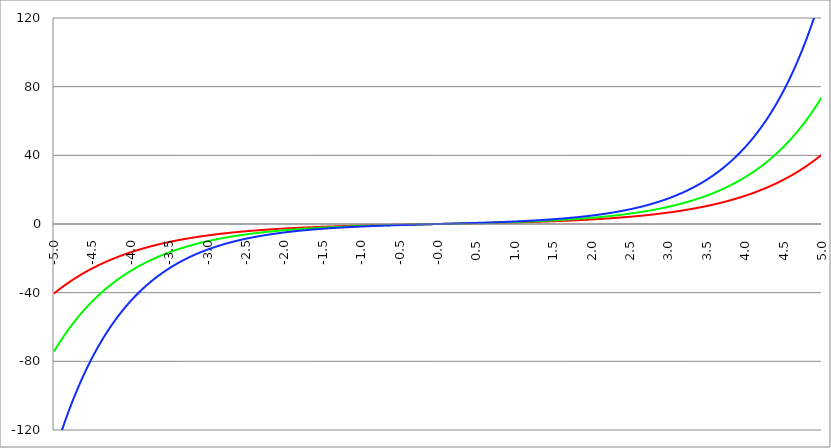
| Category | Series 1 | Series 0 | Series 2 |
|---|---|---|---|
| -5.0 | -40.503 | -74.203 | -134.578 |
| -4.995 | -40.321 | -73.833 | -133.84 |
| -4.99 | -40.14 | -73.465 | -133.106 |
| -4.985 | -39.959 | -73.098 | -132.376 |
| -4.98 | -39.78 | -72.734 | -131.65 |
| -4.975 | -39.601 | -72.371 | -130.928 |
| -4.97 | -39.423 | -72.01 | -130.21 |
| -4.965000000000001 | -39.246 | -71.651 | -129.495 |
| -4.960000000000001 | -39.07 | -71.293 | -128.785 |
| -4.955000000000001 | -38.895 | -70.938 | -128.079 |
| -4.950000000000001 | -38.72 | -70.584 | -127.376 |
| -4.945000000000001 | -38.546 | -70.232 | -126.677 |
| -4.940000000000001 | -38.373 | -69.882 | -125.983 |
| -4.935000000000001 | -38.201 | -69.533 | -125.292 |
| -4.930000000000001 | -38.029 | -69.186 | -124.604 |
| -4.925000000000002 | -37.858 | -68.841 | -123.921 |
| -4.920000000000002 | -37.688 | -68.498 | -123.241 |
| -4.915000000000002 | -37.519 | -68.156 | -122.565 |
| -4.910000000000002 | -37.351 | -67.816 | -121.893 |
| -4.905000000000002 | -37.183 | -67.478 | -121.224 |
| -4.900000000000002 | -37.016 | -67.141 | -120.559 |
| -4.895000000000002 | -36.85 | -66.806 | -119.898 |
| -4.890000000000002 | -36.684 | -66.473 | -119.24 |
| -4.885000000000002 | -36.519 | -66.141 | -118.586 |
| -4.880000000000002 | -36.355 | -65.812 | -117.936 |
| -4.875000000000003 | -36.192 | -65.483 | -117.289 |
| -4.870000000000003 | -36.029 | -65.157 | -116.646 |
| -4.865000000000003 | -35.868 | -64.832 | -116.006 |
| -4.860000000000003 | -35.707 | -64.508 | -115.37 |
| -4.855000000000003 | -35.546 | -64.186 | -114.737 |
| -4.850000000000003 | -35.387 | -63.866 | -114.107 |
| -4.845000000000003 | -35.228 | -63.548 | -113.481 |
| -4.840000000000003 | -35.069 | -63.231 | -112.859 |
| -4.835000000000003 | -34.912 | -62.915 | -112.24 |
| -4.830000000000004 | -34.755 | -62.601 | -111.624 |
| -4.825000000000004 | -34.599 | -62.289 | -111.012 |
| -4.820000000000004 | -34.444 | -61.979 | -110.403 |
| -4.815000000000004 | -34.289 | -61.669 | -109.798 |
| -4.810000000000004 | -34.135 | -61.362 | -109.195 |
| -4.805000000000004 | -33.982 | -61.056 | -108.596 |
| -4.800000000000004 | -33.829 | -60.751 | -108.001 |
| -4.795000000000004 | -33.677 | -60.448 | -107.408 |
| -4.790000000000004 | -33.526 | -60.147 | -106.819 |
| -4.785000000000004 | -33.375 | -59.847 | -106.233 |
| -4.780000000000004 | -33.225 | -59.548 | -105.65 |
| -4.775000000000004 | -33.076 | -59.251 | -105.071 |
| -4.770000000000004 | -32.927 | -58.955 | -104.495 |
| -4.765000000000005 | -32.78 | -58.661 | -103.921 |
| -4.760000000000005 | -32.632 | -58.369 | -103.351 |
| -4.755000000000005 | -32.486 | -58.078 | -102.784 |
| -4.750000000000005 | -32.34 | -57.788 | -102.221 |
| -4.745000000000005 | -32.195 | -57.5 | -101.66 |
| -4.740000000000005 | -32.05 | -57.213 | -101.102 |
| -4.735000000000005 | -31.906 | -56.927 | -100.548 |
| -4.730000000000005 | -31.763 | -56.643 | -99.996 |
| -4.725000000000006 | -31.62 | -56.361 | -99.448 |
| -4.720000000000006 | -31.478 | -56.08 | -98.902 |
| -4.715000000000006 | -31.337 | -55.8 | -98.36 |
| -4.710000000000006 | -31.196 | -55.522 | -97.82 |
| -4.705000000000006 | -31.056 | -55.245 | -97.284 |
| -4.700000000000006 | -30.916 | -54.969 | -96.75 |
| -4.695000000000006 | -30.777 | -54.695 | -96.219 |
| -4.690000000000006 | -30.639 | -54.422 | -95.692 |
| -4.685000000000007 | -30.501 | -54.151 | -95.167 |
| -4.680000000000007 | -30.364 | -53.88 | -94.645 |
| -4.675000000000007 | -30.228 | -53.612 | -94.125 |
| -4.670000000000007 | -30.092 | -53.344 | -93.609 |
| -4.665000000000007 | -29.957 | -53.078 | -93.096 |
| -4.660000000000007 | -29.823 | -52.813 | -92.585 |
| -4.655000000000007 | -29.689 | -52.55 | -92.077 |
| -4.650000000000007 | -29.555 | -52.288 | -91.572 |
| -4.645000000000007 | -29.422 | -52.027 | -91.07 |
| -4.640000000000008 | -29.29 | -51.767 | -90.57 |
| -4.635000000000008 | -29.159 | -51.509 | -90.073 |
| -4.630000000000008 | -29.028 | -51.252 | -89.579 |
| -4.625000000000008 | -28.897 | -50.996 | -89.088 |
| -4.620000000000008 | -28.768 | -50.742 | -88.599 |
| -4.615000000000008 | -28.638 | -50.489 | -88.113 |
| -4.610000000000008 | -28.51 | -50.237 | -87.63 |
| -4.605000000000008 | -28.382 | -49.986 | -87.149 |
| -4.600000000000008 | -28.254 | -49.737 | -86.671 |
| -4.595000000000009 | -28.127 | -49.489 | -86.196 |
| -4.590000000000009 | -28.001 | -49.242 | -85.723 |
| -4.585000000000009 | -27.875 | -48.996 | -85.253 |
| -4.580000000000009 | -27.75 | -48.752 | -84.785 |
| -4.57500000000001 | -27.625 | -48.509 | -84.32 |
| -4.57000000000001 | -27.501 | -48.267 | -83.858 |
| -4.565000000000009 | -27.378 | -48.026 | -83.398 |
| -4.560000000000009 | -27.255 | -47.787 | -82.94 |
| -4.555000000000009 | -27.132 | -47.548 | -82.485 |
| -4.55000000000001 | -27.01 | -47.311 | -82.033 |
| -4.54500000000001 | -26.889 | -47.075 | -81.583 |
| -4.54000000000001 | -26.768 | -46.84 | -81.135 |
| -4.53500000000001 | -26.648 | -46.606 | -80.69 |
| -4.53000000000001 | -26.528 | -46.374 | -80.248 |
| -4.52500000000001 | -26.409 | -46.143 | -79.807 |
| -4.52000000000001 | -26.29 | -45.912 | -79.37 |
| -4.51500000000001 | -26.172 | -45.683 | -78.934 |
| -4.51000000000001 | -26.055 | -45.455 | -78.501 |
| -4.505000000000011 | -25.938 | -45.229 | -78.071 |
| -4.500000000000011 | -25.821 | -45.003 | -77.642 |
| -4.495000000000011 | -25.705 | -44.779 | -77.216 |
| -4.490000000000011 | -25.59 | -44.555 | -76.793 |
| -4.485000000000011 | -25.475 | -44.333 | -76.372 |
| -4.480000000000011 | -25.36 | -44.112 | -75.953 |
| -4.475000000000011 | -25.246 | -43.892 | -75.536 |
| -4.470000000000011 | -25.133 | -43.673 | -75.122 |
| -4.465000000000011 | -25.02 | -43.455 | -74.71 |
| -4.460000000000011 | -24.907 | -43.238 | -74.3 |
| -4.455000000000012 | -24.796 | -43.022 | -73.892 |
| -4.450000000000012 | -24.684 | -42.808 | -73.487 |
| -4.445000000000012 | -24.573 | -42.594 | -73.084 |
| -4.440000000000012 | -24.463 | -42.382 | -72.683 |
| -4.435000000000012 | -24.353 | -42.17 | -72.284 |
| -4.430000000000012 | -24.243 | -41.96 | -71.888 |
| -4.425000000000012 | -24.135 | -41.75 | -71.493 |
| -4.420000000000012 | -24.026 | -41.542 | -71.101 |
| -4.415000000000012 | -23.918 | -41.335 | -70.711 |
| -4.410000000000013 | -23.811 | -41.129 | -70.323 |
| -4.405000000000013 | -23.704 | -40.923 | -69.937 |
| -4.400000000000013 | -23.597 | -40.719 | -69.554 |
| -4.395000000000013 | -23.491 | -40.516 | -69.172 |
| -4.390000000000013 | -23.386 | -40.314 | -68.793 |
| -4.385000000000013 | -23.281 | -40.113 | -68.415 |
| -4.380000000000013 | -23.176 | -39.913 | -68.04 |
| -4.375000000000013 | -23.072 | -39.714 | -67.667 |
| -4.370000000000013 | -22.968 | -39.515 | -67.296 |
| -4.365000000000013 | -22.865 | -39.318 | -66.927 |
| -4.360000000000014 | -22.762 | -39.122 | -66.559 |
| -4.355000000000014 | -22.66 | -38.927 | -66.194 |
| -4.350000000000014 | -22.558 | -38.733 | -65.831 |
| -4.345000000000014 | -22.457 | -38.54 | -65.47 |
| -4.340000000000014 | -22.356 | -38.347 | -65.111 |
| -4.335000000000014 | -22.255 | -38.156 | -64.754 |
| -4.330000000000014 | -22.155 | -37.966 | -64.398 |
| -4.325000000000014 | -22.056 | -37.776 | -64.045 |
| -4.320000000000014 | -21.957 | -37.588 | -63.694 |
| -4.315000000000015 | -21.858 | -37.4 | -63.344 |
| -4.310000000000015 | -21.76 | -37.214 | -62.997 |
| -4.305000000000015 | -21.662 | -37.028 | -62.651 |
| -4.300000000000015 | -21.565 | -36.843 | -62.308 |
| -4.295000000000015 | -21.468 | -36.659 | -61.966 |
| -4.290000000000015 | -21.371 | -36.476 | -61.626 |
| -4.285000000000015 | -21.275 | -36.294 | -61.288 |
| -4.280000000000015 | -21.18 | -36.113 | -60.952 |
| -4.275000000000015 | -21.084 | -35.933 | -60.617 |
| -4.270000000000015 | -20.99 | -35.754 | -60.285 |
| -4.265000000000016 | -20.895 | -35.575 | -59.954 |
| -4.260000000000016 | -20.801 | -35.398 | -59.625 |
| -4.255000000000016 | -20.708 | -35.221 | -59.298 |
| -4.250000000000016 | -20.615 | -35.046 | -58.973 |
| -4.245000000000016 | -20.522 | -34.871 | -58.649 |
| -4.240000000000016 | -20.43 | -34.697 | -58.328 |
| -4.235000000000016 | -20.338 | -34.524 | -58.008 |
| -4.230000000000016 | -20.247 | -34.351 | -57.689 |
| -4.225000000000017 | -20.156 | -34.18 | -57.373 |
| -4.220000000000017 | -20.065 | -34.009 | -57.058 |
| -4.215000000000017 | -19.975 | -33.84 | -56.745 |
| -4.210000000000017 | -19.885 | -33.671 | -56.434 |
| -4.205000000000017 | -19.796 | -33.503 | -56.124 |
| -4.200000000000017 | -19.707 | -33.336 | -55.816 |
| -4.195000000000017 | -19.618 | -33.169 | -55.51 |
| -4.190000000000017 | -19.53 | -33.004 | -55.206 |
| -4.185000000000017 | -19.442 | -32.839 | -54.903 |
| -4.180000000000017 | -19.355 | -32.675 | -54.602 |
| -4.175000000000018 | -19.268 | -32.512 | -54.302 |
| -4.170000000000018 | -19.181 | -32.35 | -54.004 |
| -4.165000000000018 | -19.095 | -32.189 | -53.708 |
| -4.160000000000018 | -19.009 | -32.028 | -53.413 |
| -4.155000000000018 | -18.924 | -31.868 | -53.12 |
| -4.150000000000018 | -18.839 | -31.709 | -52.829 |
| -4.145000000000018 | -18.754 | -31.551 | -52.539 |
| -4.140000000000018 | -18.67 | -31.393 | -52.251 |
| -4.135000000000018 | -18.586 | -31.237 | -51.964 |
| -4.130000000000019 | -18.502 | -31.081 | -51.679 |
| -4.125000000000019 | -18.419 | -30.926 | -51.395 |
| -4.120000000000019 | -18.336 | -30.771 | -51.113 |
| -4.115000000000019 | -18.254 | -30.618 | -50.833 |
| -4.110000000000019 | -18.172 | -30.465 | -50.554 |
| -4.105000000000019 | -18.09 | -30.313 | -50.277 |
| -4.100000000000019 | -18.009 | -30.162 | -50.001 |
| -4.095000000000019 | -17.928 | -30.011 | -49.727 |
| -4.090000000000019 | -17.847 | -29.862 | -49.454 |
| -4.085000000000019 | -17.767 | -29.713 | -49.183 |
| -4.08000000000002 | -17.687 | -29.564 | -48.913 |
| -4.07500000000002 | -17.608 | -29.417 | -48.644 |
| -4.07000000000002 | -17.529 | -29.27 | -48.377 |
| -4.06500000000002 | -17.45 | -29.124 | -48.112 |
| -4.06000000000002 | -17.371 | -28.979 | -47.848 |
| -4.05500000000002 | -17.293 | -28.834 | -47.586 |
| -4.05000000000002 | -17.215 | -28.69 | -47.324 |
| -4.04500000000002 | -17.138 | -28.547 | -47.065 |
| -4.04000000000002 | -17.061 | -28.404 | -46.807 |
| -4.03500000000002 | -16.984 | -28.263 | -46.55 |
| -4.03000000000002 | -16.908 | -28.122 | -46.294 |
| -4.025000000000021 | -16.832 | -27.981 | -46.04 |
| -4.020000000000021 | -16.756 | -27.842 | -45.788 |
| -4.015000000000021 | -16.681 | -27.703 | -45.537 |
| -4.010000000000021 | -16.606 | -27.564 | -45.287 |
| -4.005000000000021 | -16.531 | -27.427 | -45.038 |
| -4.000000000000021 | -16.457 | -27.29 | -44.791 |
| -3.995000000000021 | -16.383 | -27.154 | -44.545 |
| -3.990000000000021 | -16.309 | -27.018 | -44.301 |
| -3.985000000000022 | -16.236 | -26.883 | -44.058 |
| -3.980000000000022 | -16.163 | -26.749 | -43.816 |
| -3.975000000000022 | -16.09 | -26.616 | -43.576 |
| -3.970000000000022 | -16.018 | -26.483 | -43.337 |
| -3.965000000000022 | -15.946 | -26.351 | -43.099 |
| -3.960000000000022 | -15.874 | -26.219 | -42.863 |
| -3.955000000000022 | -15.803 | -26.088 | -42.627 |
| -3.950000000000022 | -15.732 | -25.958 | -42.393 |
| -3.945000000000022 | -15.661 | -25.828 | -42.161 |
| -3.940000000000023 | -15.59 | -25.7 | -41.93 |
| -3.935000000000023 | -15.52 | -25.571 | -41.699 |
| -3.930000000000023 | -15.451 | -25.444 | -41.471 |
| -3.925000000000023 | -15.381 | -25.317 | -41.243 |
| -3.920000000000023 | -15.312 | -25.19 | -41.017 |
| -3.915000000000023 | -15.243 | -25.065 | -40.792 |
| -3.910000000000023 | -15.174 | -24.939 | -40.568 |
| -3.905000000000023 | -15.106 | -24.815 | -40.345 |
| -3.900000000000023 | -15.038 | -24.691 | -40.124 |
| -3.895000000000023 | -14.971 | -24.568 | -39.904 |
| -3.890000000000024 | -14.903 | -24.445 | -39.685 |
| -3.885000000000024 | -14.836 | -24.323 | -39.467 |
| -3.880000000000024 | -14.77 | -24.202 | -39.251 |
| -3.875000000000024 | -14.703 | -24.081 | -39.035 |
| -3.870000000000024 | -14.637 | -23.961 | -38.821 |
| -3.865000000000024 | -14.571 | -23.841 | -38.608 |
| -3.860000000000024 | -14.506 | -23.722 | -38.396 |
| -3.855000000000024 | -14.44 | -23.604 | -38.185 |
| -3.850000000000024 | -14.375 | -23.486 | -37.976 |
| -3.845000000000025 | -14.311 | -23.369 | -37.768 |
| -3.840000000000025 | -14.246 | -23.252 | -37.56 |
| -3.835000000000025 | -14.182 | -23.136 | -37.354 |
| -3.830000000000025 | -14.118 | -23.02 | -37.149 |
| -3.825000000000025 | -14.055 | -22.905 | -36.945 |
| -3.820000000000025 | -13.992 | -22.791 | -36.743 |
| -3.815000000000025 | -13.929 | -22.677 | -36.541 |
| -3.810000000000025 | -13.866 | -22.564 | -36.341 |
| -3.805000000000025 | -13.804 | -22.451 | -36.141 |
| -3.800000000000026 | -13.742 | -22.339 | -35.943 |
| -3.795000000000026 | -13.68 | -22.228 | -35.746 |
| -3.790000000000026 | -13.618 | -22.117 | -35.549 |
| -3.785000000000026 | -13.557 | -22.006 | -35.354 |
| -3.780000000000026 | -13.496 | -21.897 | -35.16 |
| -3.775000000000026 | -13.435 | -21.787 | -34.967 |
| -3.770000000000026 | -13.375 | -21.679 | -34.775 |
| -3.765000000000026 | -13.314 | -21.57 | -34.585 |
| -3.760000000000026 | -13.255 | -21.463 | -34.395 |
| -3.755000000000026 | -13.195 | -21.355 | -34.206 |
| -3.750000000000027 | -13.136 | -21.249 | -34.018 |
| -3.745000000000027 | -13.076 | -21.143 | -33.832 |
| -3.740000000000027 | -13.018 | -21.037 | -33.646 |
| -3.735000000000027 | -12.959 | -20.932 | -33.461 |
| -3.730000000000027 | -12.901 | -20.828 | -33.278 |
| -3.725000000000027 | -12.843 | -20.724 | -33.095 |
| -3.720000000000027 | -12.785 | -20.62 | -32.914 |
| -3.715000000000027 | -12.727 | -20.517 | -32.733 |
| -3.710000000000027 | -12.67 | -20.415 | -32.553 |
| -3.705000000000028 | -12.613 | -20.313 | -32.375 |
| -3.700000000000028 | -12.556 | -20.211 | -32.197 |
| -3.695000000000028 | -12.5 | -20.11 | -32.02 |
| -3.690000000000028 | -12.443 | -20.01 | -31.845 |
| -3.685000000000028 | -12.387 | -19.91 | -31.67 |
| -3.680000000000028 | -12.332 | -19.811 | -31.496 |
| -3.675000000000028 | -12.276 | -19.712 | -31.323 |
| -3.670000000000028 | -12.221 | -19.613 | -31.151 |
| -3.665000000000028 | -12.166 | -19.515 | -30.98 |
| -3.660000000000028 | -12.111 | -19.418 | -30.81 |
| -3.655000000000029 | -12.056 | -19.321 | -30.641 |
| -3.650000000000029 | -12.002 | -19.224 | -30.473 |
| -3.645000000000029 | -11.948 | -19.128 | -30.306 |
| -3.640000000000029 | -11.894 | -19.033 | -30.139 |
| -3.635000000000029 | -11.841 | -18.938 | -29.974 |
| -3.630000000000029 | -11.787 | -18.843 | -29.809 |
| -3.625000000000029 | -11.734 | -18.749 | -29.646 |
| -3.620000000000029 | -11.682 | -18.655 | -29.483 |
| -3.615000000000029 | -11.629 | -18.562 | -29.321 |
| -3.61000000000003 | -11.577 | -18.47 | -29.16 |
| -3.60500000000003 | -11.524 | -18.377 | -29 |
| -3.60000000000003 | -11.473 | -18.285 | -28.841 |
| -3.59500000000003 | -11.421 | -18.194 | -28.683 |
| -3.59000000000003 | -11.369 | -18.103 | -28.525 |
| -3.58500000000003 | -11.318 | -18.013 | -28.369 |
| -3.58000000000003 | -11.267 | -17.923 | -28.213 |
| -3.57500000000003 | -11.217 | -17.833 | -28.058 |
| -3.57000000000003 | -11.166 | -17.744 | -27.904 |
| -3.565000000000031 | -11.116 | -17.656 | -27.751 |
| -3.560000000000031 | -11.066 | -17.567 | -27.599 |
| -3.555000000000031 | -11.016 | -17.48 | -27.447 |
| -3.550000000000031 | -10.966 | -17.392 | -27.296 |
| -3.545000000000031 | -10.917 | -17.305 | -27.147 |
| -3.540000000000031 | -10.868 | -17.219 | -26.998 |
| -3.535000000000031 | -10.819 | -17.133 | -26.849 |
| -3.530000000000031 | -10.77 | -17.047 | -26.702 |
| -3.525000000000031 | -10.721 | -16.962 | -26.555 |
| -3.520000000000032 | -10.673 | -16.877 | -26.41 |
| -3.515000000000032 | -10.625 | -16.793 | -26.265 |
| -3.510000000000032 | -10.577 | -16.709 | -26.12 |
| -3.505000000000032 | -10.529 | -16.626 | -25.977 |
| -3.500000000000032 | -10.482 | -16.543 | -25.834 |
| -3.495000000000032 | -10.435 | -16.46 | -25.693 |
| -3.490000000000032 | -10.388 | -16.378 | -25.552 |
| -3.485000000000032 | -10.341 | -16.296 | -25.411 |
| -3.480000000000032 | -10.294 | -16.214 | -25.272 |
| -3.475000000000032 | -10.248 | -16.133 | -25.133 |
| -3.470000000000033 | -10.202 | -16.053 | -24.995 |
| -3.465000000000033 | -10.156 | -15.973 | -24.858 |
| -3.460000000000033 | -10.11 | -15.893 | -24.721 |
| -3.455000000000033 | -10.064 | -15.813 | -24.586 |
| -3.450000000000033 | -10.019 | -15.734 | -24.451 |
| -3.445000000000033 | -9.974 | -15.656 | -24.316 |
| -3.440000000000033 | -9.929 | -15.577 | -24.183 |
| -3.435000000000033 | -9.884 | -15.5 | -24.05 |
| -3.430000000000033 | -9.84 | -15.422 | -23.918 |
| -3.425000000000034 | -9.795 | -15.345 | -23.787 |
| -3.420000000000034 | -9.751 | -15.268 | -23.656 |
| -3.415000000000034 | -9.707 | -15.192 | -23.526 |
| -3.410000000000034 | -9.663 | -15.116 | -23.397 |
| -3.405000000000034 | -9.62 | -15.041 | -23.269 |
| -3.400000000000034 | -9.576 | -14.965 | -23.141 |
| -3.395000000000034 | -9.533 | -14.891 | -23.014 |
| -3.390000000000034 | -9.49 | -14.816 | -22.887 |
| -3.385000000000034 | -9.447 | -14.742 | -22.762 |
| -3.380000000000034 | -9.405 | -14.668 | -22.637 |
| -3.375000000000035 | -9.362 | -14.595 | -22.512 |
| -3.370000000000035 | -9.32 | -14.522 | -22.389 |
| -3.365000000000035 | -9.278 | -14.449 | -22.266 |
| -3.360000000000035 | -9.236 | -14.377 | -22.144 |
| -3.355000000000035 | -9.195 | -14.305 | -22.022 |
| -3.350000000000035 | -9.153 | -14.234 | -21.901 |
| -3.345000000000035 | -9.112 | -14.163 | -21.781 |
| -3.340000000000035 | -9.071 | -14.092 | -21.661 |
| -3.335000000000035 | -9.03 | -14.021 | -21.542 |
| -3.330000000000036 | -8.989 | -13.951 | -21.424 |
| -3.325000000000036 | -8.948 | -13.882 | -21.306 |
| -3.320000000000036 | -8.908 | -13.812 | -21.189 |
| -3.315000000000036 | -8.868 | -13.743 | -21.073 |
| -3.310000000000036 | -8.828 | -13.674 | -20.957 |
| -3.305000000000036 | -8.788 | -13.606 | -20.842 |
| -3.300000000000036 | -8.748 | -13.538 | -20.727 |
| -3.295000000000036 | -8.709 | -13.47 | -20.614 |
| -3.290000000000036 | -8.669 | -13.403 | -20.5 |
| -3.285000000000036 | -8.63 | -13.336 | -20.388 |
| -3.280000000000036 | -8.591 | -13.269 | -20.276 |
| -3.275000000000037 | -8.553 | -13.203 | -20.164 |
| -3.270000000000037 | -8.514 | -13.137 | -20.054 |
| -3.265000000000037 | -8.476 | -13.071 | -19.944 |
| -3.260000000000037 | -8.437 | -13.006 | -19.834 |
| -3.255000000000037 | -8.399 | -12.941 | -19.725 |
| -3.250000000000037 | -8.361 | -12.876 | -19.617 |
| -3.245000000000037 | -8.323 | -12.811 | -19.509 |
| -3.240000000000037 | -8.286 | -12.747 | -19.402 |
| -3.235000000000038 | -8.248 | -12.684 | -19.295 |
| -3.230000000000038 | -8.211 | -12.62 | -19.189 |
| -3.225000000000038 | -8.174 | -12.557 | -19.084 |
| -3.220000000000038 | -8.137 | -12.494 | -18.979 |
| -3.215000000000038 | -8.1 | -12.432 | -18.875 |
| -3.210000000000038 | -8.064 | -12.369 | -18.771 |
| -3.205000000000038 | -8.027 | -12.307 | -18.668 |
| -3.200000000000038 | -7.991 | -12.246 | -18.565 |
| -3.195000000000038 | -7.955 | -12.185 | -18.463 |
| -3.190000000000039 | -7.919 | -12.124 | -18.362 |
| -3.185000000000039 | -7.883 | -12.063 | -18.261 |
| -3.180000000000039 | -7.848 | -12.003 | -18.16 |
| -3.175000000000039 | -7.812 | -11.943 | -18.061 |
| -3.170000000000039 | -7.777 | -11.883 | -17.961 |
| -3.16500000000004 | -7.742 | -11.823 | -17.863 |
| -3.16000000000004 | -7.707 | -11.764 | -17.765 |
| -3.155000000000039 | -7.672 | -11.705 | -17.667 |
| -3.150000000000039 | -7.637 | -11.647 | -17.57 |
| -3.14500000000004 | -7.603 | -11.588 | -17.473 |
| -3.14000000000004 | -7.568 | -11.53 | -17.377 |
| -3.13500000000004 | -7.534 | -11.473 | -17.282 |
| -3.13000000000004 | -7.5 | -11.415 | -17.187 |
| -3.12500000000004 | -7.466 | -11.358 | -17.092 |
| -3.12000000000004 | -7.432 | -11.301 | -16.998 |
| -3.11500000000004 | -7.399 | -11.245 | -16.905 |
| -3.11000000000004 | -7.365 | -11.188 | -16.812 |
| -3.10500000000004 | -7.332 | -11.132 | -16.72 |
| -3.10000000000004 | -7.299 | -11.076 | -16.628 |
| -3.095000000000041 | -7.266 | -11.021 | -16.536 |
| -3.090000000000041 | -7.233 | -10.966 | -16.445 |
| -3.085000000000041 | -7.2 | -10.911 | -16.355 |
| -3.080000000000041 | -7.168 | -10.856 | -16.265 |
| -3.075000000000041 | -7.135 | -10.802 | -16.176 |
| -3.070000000000041 | -7.103 | -10.748 | -16.087 |
| -3.065000000000041 | -7.071 | -10.694 | -15.998 |
| -3.060000000000041 | -7.039 | -10.64 | -15.91 |
| -3.055000000000041 | -7.007 | -10.587 | -15.823 |
| -3.050000000000042 | -6.975 | -10.534 | -15.736 |
| -3.045000000000042 | -6.944 | -10.481 | -15.649 |
| -3.040000000000042 | -6.912 | -10.429 | -15.563 |
| -3.035000000000042 | -6.881 | -10.376 | -15.478 |
| -3.030000000000042 | -6.85 | -10.324 | -15.393 |
| -3.025000000000042 | -6.819 | -10.273 | -15.308 |
| -3.020000000000042 | -6.788 | -10.221 | -15.224 |
| -3.015000000000042 | -6.757 | -10.17 | -15.14 |
| -3.010000000000042 | -6.726 | -10.119 | -15.057 |
| -3.005000000000043 | -6.696 | -10.068 | -14.974 |
| -3.000000000000043 | -6.666 | -10.018 | -14.892 |
| -2.995000000000043 | -6.635 | -9.968 | -14.81 |
| -2.990000000000043 | -6.605 | -9.918 | -14.728 |
| -2.985000000000043 | -6.575 | -9.868 | -14.647 |
| -2.980000000000043 | -6.546 | -9.819 | -14.567 |
| -2.975000000000043 | -6.516 | -9.769 | -14.487 |
| -2.970000000000043 | -6.486 | -9.72 | -14.407 |
| -2.965000000000043 | -6.457 | -9.672 | -14.328 |
| -2.960000000000043 | -6.428 | -9.623 | -14.249 |
| -2.955000000000044 | -6.399 | -9.575 | -14.17 |
| -2.950000000000044 | -6.37 | -9.527 | -14.093 |
| -2.945000000000044 | -6.341 | -9.479 | -14.015 |
| -2.940000000000044 | -6.312 | -9.431 | -13.938 |
| -2.935000000000044 | -6.283 | -9.384 | -13.861 |
| -2.930000000000044 | -6.255 | -9.337 | -13.785 |
| -2.925000000000044 | -6.226 | -9.29 | -13.709 |
| -2.920000000000044 | -6.198 | -9.244 | -13.634 |
| -2.915000000000044 | -6.17 | -9.197 | -13.559 |
| -2.910000000000045 | -6.142 | -9.151 | -13.484 |
| -2.905000000000045 | -6.114 | -9.105 | -13.41 |
| -2.900000000000045 | -6.086 | -9.06 | -13.336 |
| -2.895000000000045 | -6.059 | -9.014 | -13.263 |
| -2.890000000000045 | -6.031 | -8.969 | -13.19 |
| -2.885000000000045 | -6.004 | -8.924 | -13.117 |
| -2.880000000000045 | -5.977 | -8.879 | -13.045 |
| -2.875000000000045 | -5.95 | -8.835 | -12.973 |
| -2.870000000000045 | -5.923 | -8.79 | -12.902 |
| -2.865000000000045 | -5.896 | -8.746 | -12.831 |
| -2.860000000000046 | -5.869 | -8.702 | -12.76 |
| -2.855000000000046 | -5.842 | -8.658 | -12.69 |
| -2.850000000000046 | -5.816 | -8.615 | -12.62 |
| -2.845000000000046 | -5.789 | -8.572 | -12.55 |
| -2.840000000000046 | -5.763 | -8.529 | -12.481 |
| -2.835000000000046 | -5.737 | -8.486 | -12.413 |
| -2.830000000000046 | -5.711 | -8.443 | -12.344 |
| -2.825000000000046 | -5.685 | -8.401 | -12.276 |
| -2.820000000000046 | -5.659 | -8.359 | -12.209 |
| -2.815000000000047 | -5.633 | -8.317 | -12.141 |
| -2.810000000000047 | -5.608 | -8.275 | -12.074 |
| -2.805000000000047 | -5.582 | -8.233 | -12.008 |
| -2.800000000000047 | -5.557 | -8.192 | -11.942 |
| -2.795000000000047 | -5.531 | -8.151 | -11.876 |
| -2.790000000000047 | -5.506 | -8.11 | -11.811 |
| -2.785000000000047 | -5.481 | -8.069 | -11.746 |
| -2.780000000000047 | -5.456 | -8.028 | -11.681 |
| -2.775000000000047 | -5.431 | -7.988 | -11.617 |
| -2.770000000000047 | -5.407 | -7.948 | -11.553 |
| -2.765000000000048 | -5.382 | -7.908 | -11.489 |
| -2.760000000000048 | -5.358 | -7.868 | -11.426 |
| -2.755000000000048 | -5.333 | -7.829 | -11.363 |
| -2.750000000000048 | -5.309 | -7.789 | -11.3 |
| -2.745000000000048 | -5.285 | -7.75 | -11.238 |
| -2.740000000000048 | -5.261 | -7.711 | -11.176 |
| -2.735000000000048 | -5.237 | -7.672 | -11.114 |
| -2.730000000000048 | -5.213 | -7.634 | -11.053 |
| -2.725000000000048 | -5.189 | -7.595 | -10.992 |
| -2.720000000000049 | -5.165 | -7.557 | -10.931 |
| -2.715000000000049 | -5.142 | -7.519 | -10.871 |
| -2.710000000000049 | -5.118 | -7.481 | -10.811 |
| -2.705000000000049 | -5.095 | -7.444 | -10.752 |
| -2.700000000000049 | -5.072 | -7.406 | -10.692 |
| -2.695000000000049 | -5.049 | -7.369 | -10.633 |
| -2.690000000000049 | -5.026 | -7.332 | -10.575 |
| -2.685000000000049 | -5.003 | -7.295 | -10.516 |
| -2.680000000000049 | -4.98 | -7.258 | -10.458 |
| -2.675000000000049 | -4.957 | -7.222 | -10.401 |
| -2.67000000000005 | -4.935 | -7.185 | -10.343 |
| -2.66500000000005 | -4.912 | -7.149 | -10.286 |
| -2.66000000000005 | -4.89 | -7.113 | -10.23 |
| -2.65500000000005 | -4.867 | -7.077 | -10.173 |
| -2.65000000000005 | -4.845 | -7.042 | -10.117 |
| -2.64500000000005 | -4.823 | -7.006 | -10.061 |
| -2.64000000000005 | -4.801 | -6.971 | -10.006 |
| -2.63500000000005 | -4.779 | -6.936 | -9.95 |
| -2.63000000000005 | -4.757 | -6.901 | -9.896 |
| -2.625000000000051 | -4.735 | -6.866 | -9.841 |
| -2.620000000000051 | -4.714 | -6.831 | -9.787 |
| -2.615000000000051 | -4.692 | -6.797 | -9.733 |
| -2.610000000000051 | -4.671 | -6.763 | -9.679 |
| -2.605000000000051 | -4.649 | -6.729 | -9.625 |
| -2.600000000000051 | -4.628 | -6.695 | -9.572 |
| -2.595000000000051 | -4.607 | -6.661 | -9.519 |
| -2.590000000000051 | -4.586 | -6.627 | -9.467 |
| -2.585000000000051 | -4.565 | -6.594 | -9.415 |
| -2.580000000000052 | -4.544 | -6.561 | -9.363 |
| -2.575000000000052 | -4.523 | -6.528 | -9.311 |
| -2.570000000000052 | -4.503 | -6.495 | -9.26 |
| -2.565000000000052 | -4.482 | -6.462 | -9.208 |
| -2.560000000000052 | -4.461 | -6.429 | -9.158 |
| -2.555000000000052 | -4.441 | -6.397 | -9.107 |
| -2.550000000000052 | -4.421 | -6.365 | -9.057 |
| -2.545000000000052 | -4.4 | -6.332 | -9.007 |
| -2.540000000000052 | -4.38 | -6.3 | -8.957 |
| -2.535000000000053 | -4.36 | -6.269 | -8.907 |
| -2.530000000000053 | -4.34 | -6.237 | -8.858 |
| -2.525000000000053 | -4.32 | -6.205 | -8.809 |
| -2.520000000000053 | -4.3 | -6.174 | -8.76 |
| -2.515000000000053 | -4.281 | -6.143 | -8.712 |
| -2.510000000000053 | -4.261 | -6.112 | -8.664 |
| -2.505000000000053 | -4.242 | -6.081 | -8.616 |
| -2.500000000000053 | -4.222 | -6.05 | -8.568 |
| -2.495000000000053 | -4.203 | -6.02 | -8.521 |
| -2.490000000000053 | -4.183 | -5.989 | -8.474 |
| -2.485000000000054 | -4.164 | -5.959 | -8.427 |
| -2.480000000000054 | -4.145 | -5.929 | -8.38 |
| -2.475000000000054 | -4.126 | -5.899 | -8.334 |
| -2.470000000000054 | -4.107 | -5.869 | -8.288 |
| -2.465000000000054 | -4.088 | -5.839 | -8.242 |
| -2.460000000000054 | -4.069 | -5.81 | -8.196 |
| -2.455000000000054 | -4.051 | -5.78 | -8.151 |
| -2.450000000000054 | -4.032 | -5.751 | -8.106 |
| -2.445000000000054 | -4.013 | -5.722 | -8.061 |
| -2.440000000000055 | -3.995 | -5.693 | -8.016 |
| -2.435000000000055 | -3.977 | -5.664 | -7.972 |
| -2.430000000000055 | -3.958 | -5.635 | -7.928 |
| -2.425000000000055 | -3.94 | -5.607 | -7.884 |
| -2.420000000000055 | -3.922 | -5.578 | -7.84 |
| -2.415000000000055 | -3.904 | -5.55 | -7.797 |
| -2.410000000000055 | -3.886 | -5.522 | -7.754 |
| -2.405000000000055 | -3.868 | -5.494 | -7.711 |
| -2.400000000000055 | -3.85 | -5.466 | -7.668 |
| -2.395000000000055 | -3.832 | -5.439 | -7.626 |
| -2.390000000000056 | -3.815 | -5.411 | -7.583 |
| -2.385000000000056 | -3.797 | -5.383 | -7.541 |
| -2.380000000000056 | -3.78 | -5.356 | -7.499 |
| -2.375000000000056 | -3.762 | -5.329 | -7.458 |
| -2.370000000000056 | -3.745 | -5.302 | -7.417 |
| -2.365000000000056 | -3.727 | -5.275 | -7.375 |
| -2.360000000000056 | -3.71 | -5.248 | -7.334 |
| -2.355000000000056 | -3.693 | -5.222 | -7.294 |
| -2.350000000000056 | -3.676 | -5.195 | -7.253 |
| -2.345000000000057 | -3.659 | -5.169 | -7.213 |
| -2.340000000000057 | -3.642 | -5.142 | -7.173 |
| -2.335000000000057 | -3.625 | -5.116 | -7.133 |
| -2.330000000000057 | -3.608 | -5.09 | -7.094 |
| -2.325000000000057 | -3.592 | -5.064 | -7.054 |
| -2.320000000000057 | -3.575 | -5.039 | -7.015 |
| -2.315000000000057 | -3.559 | -5.013 | -6.976 |
| -2.310000000000057 | -3.542 | -4.988 | -6.937 |
| -2.305000000000057 | -3.526 | -4.962 | -6.899 |
| -2.300000000000058 | -3.509 | -4.937 | -6.861 |
| -2.295000000000058 | -3.493 | -4.912 | -6.823 |
| -2.290000000000058 | -3.477 | -4.887 | -6.785 |
| -2.285000000000058 | -3.461 | -4.862 | -6.747 |
| -2.280000000000058 | -3.445 | -4.837 | -6.709 |
| -2.275000000000058 | -3.429 | -4.813 | -6.672 |
| -2.270000000000058 | -3.413 | -4.788 | -6.635 |
| -2.265000000000058 | -3.397 | -4.764 | -6.598 |
| -2.260000000000058 | -3.381 | -4.739 | -6.561 |
| -2.255000000000058 | -3.365 | -4.715 | -6.525 |
| -2.250000000000059 | -3.35 | -4.691 | -6.489 |
| -2.245000000000059 | -3.334 | -4.667 | -6.453 |
| -2.240000000000059 | -3.319 | -4.643 | -6.417 |
| -2.235000000000059 | -3.303 | -4.62 | -6.381 |
| -2.23000000000006 | -3.288 | -4.596 | -6.345 |
| -2.22500000000006 | -3.273 | -4.573 | -6.31 |
| -2.22000000000006 | -3.257 | -4.549 | -6.275 |
| -2.215000000000059 | -3.242 | -4.526 | -6.24 |
| -2.210000000000059 | -3.227 | -4.503 | -6.205 |
| -2.20500000000006 | -3.212 | -4.48 | -6.171 |
| -2.20000000000006 | -3.197 | -4.457 | -6.136 |
| -2.19500000000006 | -3.182 | -4.434 | -6.102 |
| -2.19000000000006 | -3.167 | -4.412 | -6.068 |
| -2.18500000000006 | -3.153 | -4.389 | -6.034 |
| -2.18000000000006 | -3.138 | -4.367 | -6.001 |
| -2.17500000000006 | -3.123 | -4.344 | -5.967 |
| -2.17000000000006 | -3.109 | -4.322 | -5.934 |
| -2.16500000000006 | -3.094 | -4.3 | -5.901 |
| -2.160000000000061 | -3.08 | -4.278 | -5.868 |
| -2.155000000000061 | -3.065 | -4.256 | -5.835 |
| -2.150000000000061 | -3.051 | -4.234 | -5.803 |
| -2.145000000000061 | -3.037 | -4.212 | -5.77 |
| -2.140000000000061 | -3.022 | -4.191 | -5.738 |
| -2.135000000000061 | -3.008 | -4.169 | -5.706 |
| -2.130000000000061 | -2.994 | -4.148 | -5.674 |
| -2.125000000000061 | -2.98 | -4.127 | -5.642 |
| -2.120000000000061 | -2.966 | -4.106 | -5.611 |
| -2.115000000000061 | -2.952 | -4.084 | -5.579 |
| -2.110000000000062 | -2.938 | -4.064 | -5.548 |
| -2.105000000000062 | -2.924 | -4.043 | -5.517 |
| -2.100000000000062 | -2.911 | -4.022 | -5.486 |
| -2.095000000000062 | -2.897 | -4.001 | -5.456 |
| -2.090000000000062 | -2.883 | -3.981 | -5.425 |
| -2.085000000000062 | -2.87 | -3.96 | -5.395 |
| -2.080000000000062 | -2.856 | -3.94 | -5.365 |
| -2.075000000000062 | -2.843 | -3.919 | -5.335 |
| -2.070000000000062 | -2.83 | -3.899 | -5.305 |
| -2.065000000000063 | -2.816 | -3.879 | -5.275 |
| -2.060000000000063 | -2.803 | -3.859 | -5.245 |
| -2.055000000000063 | -2.79 | -3.839 | -5.216 |
| -2.050000000000063 | -2.777 | -3.82 | -5.187 |
| -2.045000000000063 | -2.763 | -3.8 | -5.158 |
| -2.040000000000063 | -2.75 | -3.78 | -5.129 |
| -2.035000000000063 | -2.737 | -3.761 | -5.1 |
| -2.030000000000063 | -2.724 | -3.741 | -5.071 |
| -2.025000000000063 | -2.712 | -3.722 | -5.043 |
| -2.020000000000064 | -2.699 | -3.703 | -5.015 |
| -2.015000000000064 | -2.686 | -3.684 | -4.986 |
| -2.010000000000064 | -2.673 | -3.665 | -4.958 |
| -2.005000000000064 | -2.661 | -3.646 | -4.931 |
| -2.000000000000064 | -2.648 | -3.627 | -4.903 |
| -1.995000000000064 | -2.635 | -3.608 | -4.875 |
| -1.990000000000064 | -2.623 | -3.589 | -4.848 |
| -1.985000000000064 | -2.61 | -3.571 | -4.821 |
| -1.980000000000064 | -2.598 | -3.552 | -4.793 |
| -1.975000000000064 | -2.586 | -3.534 | -4.766 |
| -1.970000000000065 | -2.573 | -3.516 | -4.74 |
| -1.965000000000065 | -2.561 | -3.497 | -4.713 |
| -1.960000000000065 | -2.549 | -3.479 | -4.686 |
| -1.955000000000065 | -2.537 | -3.461 | -4.66 |
| -1.950000000000065 | -2.525 | -3.443 | -4.634 |
| -1.945000000000065 | -2.513 | -3.425 | -4.608 |
| -1.940000000000065 | -2.501 | -3.408 | -4.582 |
| -1.935000000000065 | -2.489 | -3.39 | -4.556 |
| -1.930000000000065 | -2.477 | -3.372 | -4.53 |
| -1.925000000000066 | -2.465 | -3.355 | -4.505 |
| -1.920000000000066 | -2.453 | -3.337 | -4.479 |
| -1.915000000000066 | -2.442 | -3.32 | -4.454 |
| -1.910000000000066 | -2.43 | -3.303 | -4.429 |
| -1.905000000000066 | -2.418 | -3.285 | -4.404 |
| -1.900000000000066 | -2.407 | -3.268 | -4.379 |
| -1.895000000000066 | -2.395 | -3.251 | -4.354 |
| -1.890000000000066 | -2.384 | -3.234 | -4.329 |
| -1.885000000000066 | -2.372 | -3.217 | -4.305 |
| -1.880000000000066 | -2.361 | -3.2 | -4.28 |
| -1.875000000000067 | -2.349 | -3.184 | -4.256 |
| -1.870000000000067 | -2.338 | -3.167 | -4.232 |
| -1.865000000000067 | -2.327 | -3.151 | -4.208 |
| -1.860000000000067 | -2.316 | -3.134 | -4.184 |
| -1.855000000000067 | -2.305 | -3.118 | -4.16 |
| -1.850000000000067 | -2.293 | -3.101 | -4.137 |
| -1.845000000000067 | -2.282 | -3.085 | -4.113 |
| -1.840000000000067 | -2.271 | -3.069 | -4.09 |
| -1.835000000000067 | -2.26 | -3.053 | -4.067 |
| -1.830000000000068 | -2.249 | -3.037 | -4.044 |
| -1.825000000000068 | -2.239 | -3.021 | -4.021 |
| -1.820000000000068 | -2.228 | -3.005 | -3.998 |
| -1.815000000000068 | -2.217 | -2.989 | -3.975 |
| -1.810000000000068 | -2.206 | -2.973 | -3.952 |
| -1.805000000000068 | -2.195 | -2.958 | -3.93 |
| -1.800000000000068 | -2.185 | -2.942 | -3.908 |
| -1.795000000000068 | -2.174 | -2.927 | -3.885 |
| -1.790000000000068 | -2.164 | -2.911 | -3.863 |
| -1.785000000000068 | -2.153 | -2.896 | -3.841 |
| -1.780000000000069 | -2.143 | -2.881 | -3.819 |
| -1.775000000000069 | -2.132 | -2.865 | -3.797 |
| -1.770000000000069 | -2.122 | -2.85 | -3.776 |
| -1.765000000000069 | -2.111 | -2.835 | -3.754 |
| -1.760000000000069 | -2.101 | -2.82 | -3.733 |
| -1.75500000000007 | -2.091 | -2.805 | -3.711 |
| -1.75000000000007 | -2.081 | -2.79 | -3.69 |
| -1.745000000000069 | -2.07 | -2.776 | -3.669 |
| -1.740000000000069 | -2.06 | -2.761 | -3.648 |
| -1.73500000000007 | -2.05 | -2.746 | -3.627 |
| -1.73000000000007 | -2.04 | -2.732 | -3.606 |
| -1.72500000000007 | -2.03 | -2.717 | -3.586 |
| -1.72000000000007 | -2.02 | -2.703 | -3.565 |
| -1.71500000000007 | -2.01 | -2.688 | -3.545 |
| -1.71000000000007 | -2 | -2.674 | -3.524 |
| -1.70500000000007 | -1.991 | -2.66 | -3.504 |
| -1.70000000000007 | -1.981 | -2.646 | -3.484 |
| -1.69500000000007 | -1.971 | -2.632 | -3.464 |
| -1.69000000000007 | -1.961 | -2.617 | -3.444 |
| -1.685000000000071 | -1.952 | -2.604 | -3.424 |
| -1.680000000000071 | -1.942 | -2.59 | -3.404 |
| -1.675000000000071 | -1.932 | -2.576 | -3.385 |
| -1.670000000000071 | -1.923 | -2.562 | -3.365 |
| -1.665000000000071 | -1.913 | -2.548 | -3.346 |
| -1.660000000000071 | -1.904 | -2.535 | -3.326 |
| -1.655000000000071 | -1.894 | -2.521 | -3.307 |
| -1.650000000000071 | -1.885 | -2.507 | -3.288 |
| -1.645000000000071 | -1.875 | -2.494 | -3.269 |
| -1.640000000000072 | -1.866 | -2.481 | -3.25 |
| -1.635000000000072 | -1.857 | -2.467 | -3.231 |
| -1.630000000000072 | -1.848 | -2.454 | -3.213 |
| -1.625000000000072 | -1.838 | -2.441 | -3.194 |
| -1.620000000000072 | -1.829 | -2.428 | -3.175 |
| -1.615000000000072 | -1.82 | -2.414 | -3.157 |
| -1.610000000000072 | -1.811 | -2.401 | -3.139 |
| -1.605000000000072 | -1.802 | -2.388 | -3.12 |
| -1.600000000000072 | -1.793 | -2.376 | -3.102 |
| -1.595000000000073 | -1.784 | -2.363 | -3.084 |
| -1.590000000000073 | -1.775 | -2.35 | -3.066 |
| -1.585000000000073 | -1.766 | -2.337 | -3.048 |
| -1.580000000000073 | -1.757 | -2.324 | -3.031 |
| -1.575000000000073 | -1.748 | -2.312 | -3.013 |
| -1.570000000000073 | -1.739 | -2.299 | -2.995 |
| -1.565000000000073 | -1.73 | -2.287 | -2.978 |
| -1.560000000000073 | -1.722 | -2.274 | -2.96 |
| -1.555000000000073 | -1.713 | -2.262 | -2.943 |
| -1.550000000000074 | -1.704 | -2.25 | -2.926 |
| -1.545000000000074 | -1.696 | -2.237 | -2.909 |
| -1.540000000000074 | -1.687 | -2.225 | -2.892 |
| -1.535000000000074 | -1.678 | -2.213 | -2.875 |
| -1.530000000000074 | -1.67 | -2.201 | -2.858 |
| -1.525000000000074 | -1.661 | -2.189 | -2.841 |
| -1.520000000000074 | -1.653 | -2.177 | -2.824 |
| -1.515000000000074 | -1.644 | -2.165 | -2.808 |
| -1.510000000000074 | -1.636 | -2.153 | -2.791 |
| -1.505000000000074 | -1.628 | -2.141 | -2.775 |
| -1.500000000000075 | -1.619 | -2.129 | -2.758 |
| -1.495000000000075 | -1.611 | -2.118 | -2.742 |
| -1.490000000000075 | -1.603 | -2.106 | -2.726 |
| -1.485000000000075 | -1.594 | -2.094 | -2.71 |
| -1.480000000000075 | -1.586 | -2.083 | -2.694 |
| -1.475000000000075 | -1.578 | -2.071 | -2.678 |
| -1.470000000000075 | -1.57 | -2.06 | -2.662 |
| -1.465000000000075 | -1.562 | -2.048 | -2.646 |
| -1.460000000000075 | -1.554 | -2.037 | -2.63 |
| -1.455000000000076 | -1.545 | -2.026 | -2.615 |
| -1.450000000000076 | -1.537 | -2.014 | -2.599 |
| -1.445000000000076 | -1.529 | -2.003 | -2.583 |
| -1.440000000000076 | -1.521 | -1.992 | -2.568 |
| -1.435000000000076 | -1.514 | -1.981 | -2.553 |
| -1.430000000000076 | -1.506 | -1.97 | -2.538 |
| -1.425000000000076 | -1.498 | -1.959 | -2.522 |
| -1.420000000000076 | -1.49 | -1.948 | -2.507 |
| -1.415000000000076 | -1.482 | -1.937 | -2.492 |
| -1.410000000000077 | -1.474 | -1.926 | -2.477 |
| -1.405000000000077 | -1.467 | -1.915 | -2.462 |
| -1.400000000000077 | -1.459 | -1.904 | -2.448 |
| -1.395000000000077 | -1.451 | -1.894 | -2.433 |
| -1.390000000000077 | -1.443 | -1.883 | -2.418 |
| -1.385000000000077 | -1.436 | -1.872 | -2.404 |
| -1.380000000000077 | -1.428 | -1.862 | -2.389 |
| -1.375000000000077 | -1.421 | -1.851 | -2.375 |
| -1.370000000000077 | -1.413 | -1.841 | -2.36 |
| -1.365000000000077 | -1.406 | -1.83 | -2.346 |
| -1.360000000000078 | -1.398 | -1.82 | -2.332 |
| -1.355000000000078 | -1.391 | -1.809 | -2.318 |
| -1.350000000000078 | -1.383 | -1.799 | -2.304 |
| -1.345000000000078 | -1.376 | -1.789 | -2.29 |
| -1.340000000000078 | -1.368 | -1.779 | -2.276 |
| -1.335000000000078 | -1.361 | -1.768 | -2.262 |
| -1.330000000000078 | -1.354 | -1.758 | -2.248 |
| -1.325000000000078 | -1.346 | -1.748 | -2.234 |
| -1.320000000000078 | -1.339 | -1.738 | -2.221 |
| -1.315000000000079 | -1.332 | -1.728 | -2.207 |
| -1.310000000000079 | -1.325 | -1.718 | -2.194 |
| -1.305000000000079 | -1.317 | -1.708 | -2.18 |
| -1.300000000000079 | -1.31 | -1.698 | -2.167 |
| -1.295000000000079 | -1.303 | -1.689 | -2.153 |
| -1.29000000000008 | -1.296 | -1.679 | -2.14 |
| -1.285000000000079 | -1.289 | -1.669 | -2.127 |
| -1.280000000000079 | -1.282 | -1.659 | -2.114 |
| -1.275000000000079 | -1.275 | -1.65 | -2.101 |
| -1.270000000000079 | -1.268 | -1.64 | -2.088 |
| -1.26500000000008 | -1.261 | -1.63 | -2.075 |
| -1.26000000000008 | -1.254 | -1.621 | -2.062 |
| -1.25500000000008 | -1.247 | -1.611 | -2.049 |
| -1.25000000000008 | -1.24 | -1.602 | -2.036 |
| -1.24500000000008 | -1.233 | -1.592 | -2.024 |
| -1.24000000000008 | -1.226 | -1.583 | -2.011 |
| -1.23500000000008 | -1.219 | -1.574 | -1.998 |
| -1.23000000000008 | -1.213 | -1.564 | -1.986 |
| -1.22500000000008 | -1.206 | -1.555 | -1.973 |
| -1.220000000000081 | -1.199 | -1.546 | -1.961 |
| -1.215000000000081 | -1.192 | -1.537 | -1.949 |
| -1.210000000000081 | -1.186 | -1.528 | -1.936 |
| -1.205000000000081 | -1.179 | -1.519 | -1.924 |
| -1.200000000000081 | -1.172 | -1.509 | -1.912 |
| -1.195000000000081 | -1.166 | -1.5 | -1.9 |
| -1.190000000000081 | -1.159 | -1.491 | -1.888 |
| -1.185000000000081 | -1.152 | -1.482 | -1.876 |
| -1.180000000000081 | -1.146 | -1.474 | -1.864 |
| -1.175000000000082 | -1.139 | -1.465 | -1.852 |
| -1.170000000000082 | -1.133 | -1.456 | -1.84 |
| -1.165000000000082 | -1.126 | -1.447 | -1.828 |
| -1.160000000000082 | -1.12 | -1.438 | -1.817 |
| -1.155000000000082 | -1.113 | -1.429 | -1.805 |
| -1.150000000000082 | -1.107 | -1.421 | -1.793 |
| -1.145000000000082 | -1.101 | -1.412 | -1.782 |
| -1.140000000000082 | -1.094 | -1.403 | -1.77 |
| -1.135000000000082 | -1.088 | -1.395 | -1.759 |
| -1.130000000000082 | -1.081 | -1.386 | -1.748 |
| -1.125000000000083 | -1.075 | -1.378 | -1.736 |
| -1.120000000000083 | -1.069 | -1.369 | -1.725 |
| -1.115000000000083 | -1.063 | -1.361 | -1.714 |
| -1.110000000000083 | -1.056 | -1.352 | -1.703 |
| -1.105000000000083 | -1.05 | -1.344 | -1.691 |
| -1.100000000000083 | -1.044 | -1.336 | -1.68 |
| -1.095000000000083 | -1.038 | -1.327 | -1.669 |
| -1.090000000000083 | -1.031 | -1.319 | -1.658 |
| -1.085000000000083 | -1.025 | -1.311 | -1.647 |
| -1.080000000000084 | -1.019 | -1.303 | -1.637 |
| -1.075000000000084 | -1.013 | -1.294 | -1.626 |
| -1.070000000000084 | -1.007 | -1.286 | -1.615 |
| -1.065000000000084 | -1.001 | -1.278 | -1.604 |
| -1.060000000000084 | -0.995 | -1.27 | -1.594 |
| -1.055000000000084 | -0.989 | -1.262 | -1.583 |
| -1.050000000000084 | -0.983 | -1.254 | -1.572 |
| -1.045000000000084 | -0.977 | -1.246 | -1.562 |
| -1.040000000000084 | -0.971 | -1.238 | -1.551 |
| -1.035000000000085 | -0.965 | -1.23 | -1.541 |
| -1.030000000000085 | -0.959 | -1.222 | -1.531 |
| -1.025000000000085 | -0.953 | -1.214 | -1.52 |
| -1.020000000000085 | -0.947 | -1.206 | -1.51 |
| -1.015000000000085 | -0.941 | -1.198 | -1.5 |
| -1.010000000000085 | -0.936 | -1.191 | -1.489 |
| -1.005000000000085 | -0.93 | -1.183 | -1.479 |
| -1.000000000000085 | -0.924 | -1.175 | -1.469 |
| -0.995000000000085 | -0.918 | -1.168 | -1.459 |
| -0.990000000000085 | -0.912 | -1.16 | -1.449 |
| -0.985000000000085 | -0.907 | -1.152 | -1.439 |
| -0.980000000000085 | -0.901 | -1.145 | -1.429 |
| -0.975000000000085 | -0.895 | -1.137 | -1.419 |
| -0.970000000000085 | -0.889 | -1.129 | -1.409 |
| -0.965000000000085 | -0.884 | -1.122 | -1.4 |
| -0.960000000000085 | -0.878 | -1.114 | -1.39 |
| -0.955000000000085 | -0.872 | -1.107 | -1.38 |
| -0.950000000000085 | -0.867 | -1.099 | -1.37 |
| -0.945000000000085 | -0.861 | -1.092 | -1.361 |
| -0.940000000000085 | -0.856 | -1.085 | -1.351 |
| -0.935000000000085 | -0.85 | -1.077 | -1.342 |
| -0.930000000000085 | -0.844 | -1.07 | -1.332 |
| -0.925000000000085 | -0.839 | -1.063 | -1.323 |
| -0.920000000000085 | -0.833 | -1.055 | -1.313 |
| -0.915000000000085 | -0.828 | -1.048 | -1.304 |
| -0.910000000000085 | -0.822 | -1.041 | -1.294 |
| -0.905000000000085 | -0.817 | -1.034 | -1.285 |
| -0.900000000000085 | -0.811 | -1.027 | -1.276 |
| -0.895000000000085 | -0.806 | -1.019 | -1.267 |
| -0.890000000000085 | -0.8 | -1.012 | -1.257 |
| -0.885000000000085 | -0.795 | -1.005 | -1.248 |
| -0.880000000000085 | -0.79 | -0.998 | -1.239 |
| -0.875000000000085 | -0.784 | -0.991 | -1.23 |
| -0.870000000000085 | -0.779 | -0.984 | -1.221 |
| -0.865000000000085 | -0.774 | -0.977 | -1.212 |
| -0.860000000000085 | -0.768 | -0.97 | -1.203 |
| -0.855000000000085 | -0.763 | -0.963 | -1.194 |
| -0.850000000000085 | -0.758 | -0.956 | -1.185 |
| -0.845000000000085 | -0.752 | -0.949 | -1.176 |
| -0.840000000000085 | -0.747 | -0.942 | -1.167 |
| -0.835000000000085 | -0.742 | -0.935 | -1.159 |
| -0.830000000000085 | -0.737 | -0.929 | -1.15 |
| -0.825000000000085 | -0.731 | -0.922 | -1.141 |
| -0.820000000000085 | -0.726 | -0.915 | -1.132 |
| -0.815000000000085 | -0.721 | -0.908 | -1.124 |
| -0.810000000000085 | -0.716 | -0.902 | -1.115 |
| -0.805000000000085 | -0.711 | -0.895 | -1.106 |
| -0.800000000000085 | -0.705 | -0.888 | -1.098 |
| -0.795000000000085 | -0.7 | -0.881 | -1.089 |
| -0.790000000000085 | -0.695 | -0.875 | -1.081 |
| -0.785000000000085 | -0.69 | -0.868 | -1.072 |
| -0.780000000000085 | -0.685 | -0.862 | -1.064 |
| -0.775000000000085 | -0.68 | -0.855 | -1.056 |
| -0.770000000000085 | -0.675 | -0.848 | -1.047 |
| -0.765000000000085 | -0.67 | -0.842 | -1.039 |
| -0.760000000000085 | -0.665 | -0.835 | -1.031 |
| -0.755000000000085 | -0.66 | -0.829 | -1.022 |
| -0.750000000000085 | -0.655 | -0.822 | -1.014 |
| -0.745000000000085 | -0.65 | -0.816 | -1.006 |
| -0.740000000000085 | -0.645 | -0.809 | -0.998 |
| -0.735000000000085 | -0.64 | -0.803 | -0.989 |
| -0.730000000000085 | -0.635 | -0.797 | -0.981 |
| -0.725000000000085 | -0.63 | -0.79 | -0.973 |
| -0.720000000000085 | -0.625 | -0.784 | -0.965 |
| -0.715000000000085 | -0.62 | -0.777 | -0.957 |
| -0.710000000000085 | -0.615 | -0.771 | -0.949 |
| -0.705000000000085 | -0.61 | -0.765 | -0.941 |
| -0.700000000000085 | -0.605 | -0.759 | -0.933 |
| -0.695000000000085 | -0.6 | -0.752 | -0.925 |
| -0.690000000000085 | -0.596 | -0.746 | -0.917 |
| -0.685000000000085 | -0.591 | -0.74 | -0.91 |
| -0.680000000000085 | -0.586 | -0.734 | -0.902 |
| -0.675000000000085 | -0.581 | -0.727 | -0.894 |
| -0.670000000000085 | -0.576 | -0.721 | -0.886 |
| -0.665000000000085 | -0.571 | -0.715 | -0.878 |
| -0.660000000000085 | -0.567 | -0.709 | -0.871 |
| -0.655000000000085 | -0.562 | -0.703 | -0.863 |
| -0.650000000000085 | -0.557 | -0.697 | -0.855 |
| -0.645000000000085 | -0.552 | -0.691 | -0.848 |
| -0.640000000000085 | -0.548 | -0.685 | -0.84 |
| -0.635000000000085 | -0.543 | -0.679 | -0.832 |
| -0.630000000000085 | -0.538 | -0.673 | -0.825 |
| -0.625000000000085 | -0.533 | -0.666 | -0.817 |
| -0.620000000000085 | -0.529 | -0.66 | -0.81 |
| -0.615000000000085 | -0.524 | -0.655 | -0.802 |
| -0.610000000000085 | -0.519 | -0.649 | -0.795 |
| -0.605000000000085 | -0.515 | -0.643 | -0.787 |
| -0.600000000000085 | -0.51 | -0.637 | -0.78 |
| -0.595000000000085 | -0.505 | -0.631 | -0.772 |
| -0.590000000000085 | -0.501 | -0.625 | -0.765 |
| -0.585000000000085 | -0.496 | -0.619 | -0.758 |
| -0.580000000000085 | -0.491 | -0.613 | -0.75 |
| -0.575000000000085 | -0.487 | -0.607 | -0.743 |
| -0.570000000000085 | -0.482 | -0.601 | -0.736 |
| -0.565000000000085 | -0.478 | -0.596 | -0.729 |
| -0.560000000000085 | -0.473 | -0.59 | -0.721 |
| -0.555000000000085 | -0.468 | -0.584 | -0.714 |
| -0.550000000000085 | -0.464 | -0.578 | -0.707 |
| -0.545000000000085 | -0.459 | -0.572 | -0.7 |
| -0.540000000000085 | -0.455 | -0.567 | -0.693 |
| -0.535000000000085 | -0.45 | -0.561 | -0.685 |
| -0.530000000000085 | -0.446 | -0.555 | -0.678 |
| -0.525000000000085 | -0.441 | -0.549 | -0.671 |
| -0.520000000000085 | -0.437 | -0.544 | -0.664 |
| -0.515000000000085 | -0.432 | -0.538 | -0.657 |
| -0.510000000000085 | -0.428 | -0.532 | -0.65 |
| -0.505000000000085 | -0.423 | -0.527 | -0.643 |
| -0.500000000000085 | -0.419 | -0.521 | -0.636 |
| -0.495000000000085 | -0.414 | -0.515 | -0.629 |
| -0.490000000000085 | -0.41 | -0.51 | -0.622 |
| -0.485000000000085 | -0.405 | -0.504 | -0.615 |
| -0.480000000000085 | -0.401 | -0.499 | -0.608 |
| -0.475000000000085 | -0.397 | -0.493 | -0.601 |
| -0.470000000000085 | -0.392 | -0.487 | -0.594 |
| -0.465000000000085 | -0.388 | -0.482 | -0.588 |
| -0.460000000000085 | -0.383 | -0.476 | -0.581 |
| -0.455000000000085 | -0.379 | -0.471 | -0.574 |
| -0.450000000000085 | -0.375 | -0.465 | -0.567 |
| -0.445000000000085 | -0.37 | -0.46 | -0.56 |
| -0.440000000000085 | -0.366 | -0.454 | -0.553 |
| -0.435000000000085 | -0.361 | -0.449 | -0.547 |
| -0.430000000000085 | -0.357 | -0.443 | -0.54 |
| -0.425000000000085 | -0.353 | -0.438 | -0.533 |
| -0.420000000000085 | -0.348 | -0.432 | -0.526 |
| -0.415000000000085 | -0.344 | -0.427 | -0.52 |
| -0.410000000000085 | -0.34 | -0.422 | -0.513 |
| -0.405000000000085 | -0.335 | -0.416 | -0.506 |
| -0.400000000000085 | -0.331 | -0.411 | -0.5 |
| -0.395000000000085 | -0.327 | -0.405 | -0.493 |
| -0.390000000000085 | -0.322 | -0.4 | -0.487 |
| -0.385000000000085 | -0.318 | -0.395 | -0.48 |
| -0.380000000000085 | -0.314 | -0.389 | -0.473 |
| -0.375000000000085 | -0.31 | -0.384 | -0.467 |
| -0.370000000000085 | -0.305 | -0.379 | -0.46 |
| -0.365000000000085 | -0.301 | -0.373 | -0.454 |
| -0.360000000000085 | -0.297 | -0.368 | -0.447 |
| -0.355000000000085 | -0.292 | -0.363 | -0.441 |
| -0.350000000000085 | -0.288 | -0.357 | -0.434 |
| -0.345000000000085 | -0.284 | -0.352 | -0.428 |
| -0.340000000000085 | -0.28 | -0.347 | -0.421 |
| -0.335000000000085 | -0.275 | -0.341 | -0.415 |
| -0.330000000000085 | -0.271 | -0.336 | -0.408 |
| -0.325000000000085 | -0.267 | -0.331 | -0.402 |
| -0.320000000000085 | -0.263 | -0.325 | -0.395 |
| -0.315000000000085 | -0.259 | -0.32 | -0.389 |
| -0.310000000000085 | -0.254 | -0.315 | -0.382 |
| -0.305000000000085 | -0.25 | -0.31 | -0.376 |
| -0.300000000000085 | -0.246 | -0.305 | -0.37 |
| -0.295000000000085 | -0.242 | -0.299 | -0.363 |
| -0.290000000000085 | -0.238 | -0.294 | -0.357 |
| -0.285000000000085 | -0.233 | -0.289 | -0.351 |
| -0.280000000000085 | -0.229 | -0.284 | -0.344 |
| -0.275000000000085 | -0.225 | -0.278 | -0.338 |
| -0.270000000000085 | -0.221 | -0.273 | -0.332 |
| -0.265000000000085 | -0.217 | -0.268 | -0.325 |
| -0.260000000000085 | -0.213 | -0.263 | -0.319 |
| -0.255000000000085 | -0.208 | -0.258 | -0.313 |
| -0.250000000000085 | -0.204 | -0.253 | -0.306 |
| -0.245000000000085 | -0.2 | -0.247 | -0.3 |
| -0.240000000000085 | -0.196 | -0.242 | -0.294 |
| -0.235000000000085 | -0.192 | -0.237 | -0.288 |
| -0.230000000000085 | -0.188 | -0.232 | -0.281 |
| -0.225000000000085 | -0.183 | -0.227 | -0.275 |
| -0.220000000000085 | -0.179 | -0.222 | -0.269 |
| -0.215000000000085 | -0.175 | -0.217 | -0.263 |
| -0.210000000000085 | -0.171 | -0.212 | -0.256 |
| -0.205000000000085 | -0.167 | -0.206 | -0.25 |
| -0.200000000000085 | -0.163 | -0.201 | -0.244 |
| -0.195000000000085 | -0.159 | -0.196 | -0.238 |
| -0.190000000000085 | -0.155 | -0.191 | -0.232 |
| -0.185000000000085 | -0.151 | -0.186 | -0.225 |
| -0.180000000000085 | -0.146 | -0.181 | -0.219 |
| -0.175000000000085 | -0.142 | -0.176 | -0.213 |
| -0.170000000000085 | -0.138 | -0.171 | -0.207 |
| -0.165000000000085 | -0.134 | -0.166 | -0.201 |
| -0.160000000000085 | -0.13 | -0.161 | -0.195 |
| -0.155000000000084 | -0.126 | -0.156 | -0.188 |
| -0.150000000000084 | -0.122 | -0.151 | -0.182 |
| -0.145000000000084 | -0.118 | -0.146 | -0.176 |
| -0.140000000000084 | -0.114 | -0.14 | -0.17 |
| -0.135000000000084 | -0.11 | -0.135 | -0.164 |
| -0.130000000000084 | -0.106 | -0.13 | -0.158 |
| -0.125000000000084 | -0.101 | -0.125 | -0.152 |
| -0.120000000000084 | -0.097 | -0.12 | -0.146 |
| -0.115000000000084 | -0.093 | -0.115 | -0.14 |
| -0.110000000000084 | -0.089 | -0.11 | -0.133 |
| -0.105000000000084 | -0.085 | -0.105 | -0.127 |
| -0.100000000000084 | -0.081 | -0.1 | -0.121 |
| -0.0950000000000844 | -0.077 | -0.095 | -0.115 |
| -0.0900000000000844 | -0.073 | -0.09 | -0.109 |
| -0.0850000000000844 | -0.069 | -0.085 | -0.103 |
| -0.0800000000000844 | -0.065 | -0.08 | -0.097 |
| -0.0750000000000844 | -0.061 | -0.075 | -0.091 |
| -0.0700000000000844 | -0.057 | -0.07 | -0.085 |
| -0.0650000000000844 | -0.053 | -0.065 | -0.079 |
| -0.0600000000000844 | -0.049 | -0.06 | -0.073 |
| -0.0550000000000844 | -0.045 | -0.055 | -0.067 |
| -0.0500000000000844 | -0.041 | -0.05 | -0.061 |
| -0.0450000000000844 | -0.036 | -0.045 | -0.054 |
| -0.0400000000000844 | -0.032 | -0.04 | -0.048 |
| -0.0350000000000844 | -0.028 | -0.035 | -0.042 |
| -0.0300000000000844 | -0.024 | -0.03 | -0.036 |
| -0.0250000000000844 | -0.02 | -0.025 | -0.03 |
| -0.0200000000000844 | -0.016 | -0.02 | -0.024 |
| -0.0150000000000844 | -0.012 | -0.015 | -0.018 |
| -0.0100000000000844 | -0.008 | -0.01 | -0.012 |
| -0.00500000000008444 | -0.004 | -0.005 | -0.006 |
| -8.4444604087075e-14 | 0 | 0 | 0 |
| 0.00499999999991555 | 0.004 | 0.005 | 0.006 |
| 0.00999999999991555 | 0.008 | 0.01 | 0.012 |
| 0.0149999999999156 | 0.012 | 0.015 | 0.018 |
| 0.0199999999999156 | 0.016 | 0.02 | 0.024 |
| 0.0249999999999156 | 0.02 | 0.025 | 0.03 |
| 0.0299999999999156 | 0.024 | 0.03 | 0.036 |
| 0.0349999999999155 | 0.028 | 0.035 | 0.042 |
| 0.0399999999999155 | 0.032 | 0.04 | 0.048 |
| 0.0449999999999155 | 0.036 | 0.045 | 0.054 |
| 0.0499999999999155 | 0.041 | 0.05 | 0.061 |
| 0.0549999999999155 | 0.045 | 0.055 | 0.067 |
| 0.0599999999999155 | 0.049 | 0.06 | 0.073 |
| 0.0649999999999155 | 0.053 | 0.065 | 0.079 |
| 0.0699999999999155 | 0.057 | 0.07 | 0.085 |
| 0.0749999999999155 | 0.061 | 0.075 | 0.091 |
| 0.0799999999999155 | 0.065 | 0.08 | 0.097 |
| 0.0849999999999155 | 0.069 | 0.085 | 0.103 |
| 0.0899999999999155 | 0.073 | 0.09 | 0.109 |
| 0.0949999999999155 | 0.077 | 0.095 | 0.115 |
| 0.0999999999999155 | 0.081 | 0.1 | 0.121 |
| 0.104999999999916 | 0.085 | 0.105 | 0.127 |
| 0.109999999999916 | 0.089 | 0.11 | 0.133 |
| 0.114999999999916 | 0.093 | 0.115 | 0.14 |
| 0.119999999999916 | 0.097 | 0.12 | 0.146 |
| 0.124999999999916 | 0.101 | 0.125 | 0.152 |
| 0.129999999999916 | 0.106 | 0.13 | 0.158 |
| 0.134999999999916 | 0.11 | 0.135 | 0.164 |
| 0.139999999999916 | 0.114 | 0.14 | 0.17 |
| 0.144999999999916 | 0.118 | 0.146 | 0.176 |
| 0.149999999999916 | 0.122 | 0.151 | 0.182 |
| 0.154999999999916 | 0.126 | 0.156 | 0.188 |
| 0.159999999999916 | 0.13 | 0.161 | 0.195 |
| 0.164999999999916 | 0.134 | 0.166 | 0.201 |
| 0.169999999999916 | 0.138 | 0.171 | 0.207 |
| 0.174999999999916 | 0.142 | 0.176 | 0.213 |
| 0.179999999999916 | 0.146 | 0.181 | 0.219 |
| 0.184999999999916 | 0.151 | 0.186 | 0.225 |
| 0.189999999999916 | 0.155 | 0.191 | 0.232 |
| 0.194999999999916 | 0.159 | 0.196 | 0.238 |
| 0.199999999999916 | 0.163 | 0.201 | 0.244 |
| 0.204999999999916 | 0.167 | 0.206 | 0.25 |
| 0.209999999999916 | 0.171 | 0.212 | 0.256 |
| 0.214999999999916 | 0.175 | 0.217 | 0.263 |
| 0.219999999999916 | 0.179 | 0.222 | 0.269 |
| 0.224999999999916 | 0.183 | 0.227 | 0.275 |
| 0.229999999999916 | 0.188 | 0.232 | 0.281 |
| 0.234999999999916 | 0.192 | 0.237 | 0.288 |
| 0.239999999999916 | 0.196 | 0.242 | 0.294 |
| 0.244999999999916 | 0.2 | 0.247 | 0.3 |
| 0.249999999999916 | 0.204 | 0.253 | 0.306 |
| 0.254999999999916 | 0.208 | 0.258 | 0.313 |
| 0.259999999999916 | 0.213 | 0.263 | 0.319 |
| 0.264999999999916 | 0.217 | 0.268 | 0.325 |
| 0.269999999999916 | 0.221 | 0.273 | 0.332 |
| 0.274999999999916 | 0.225 | 0.278 | 0.338 |
| 0.279999999999916 | 0.229 | 0.284 | 0.344 |
| 0.284999999999916 | 0.233 | 0.289 | 0.351 |
| 0.289999999999916 | 0.238 | 0.294 | 0.357 |
| 0.294999999999916 | 0.242 | 0.299 | 0.363 |
| 0.299999999999916 | 0.246 | 0.305 | 0.37 |
| 0.304999999999916 | 0.25 | 0.31 | 0.376 |
| 0.309999999999916 | 0.254 | 0.315 | 0.382 |
| 0.314999999999916 | 0.259 | 0.32 | 0.389 |
| 0.319999999999916 | 0.263 | 0.325 | 0.395 |
| 0.324999999999916 | 0.267 | 0.331 | 0.402 |
| 0.329999999999916 | 0.271 | 0.336 | 0.408 |
| 0.334999999999916 | 0.275 | 0.341 | 0.415 |
| 0.339999999999916 | 0.28 | 0.347 | 0.421 |
| 0.344999999999916 | 0.284 | 0.352 | 0.428 |
| 0.349999999999916 | 0.288 | 0.357 | 0.434 |
| 0.354999999999916 | 0.292 | 0.363 | 0.441 |
| 0.359999999999916 | 0.297 | 0.368 | 0.447 |
| 0.364999999999916 | 0.301 | 0.373 | 0.454 |
| 0.369999999999916 | 0.305 | 0.379 | 0.46 |
| 0.374999999999916 | 0.31 | 0.384 | 0.467 |
| 0.379999999999916 | 0.314 | 0.389 | 0.473 |
| 0.384999999999916 | 0.318 | 0.395 | 0.48 |
| 0.389999999999916 | 0.322 | 0.4 | 0.487 |
| 0.394999999999916 | 0.327 | 0.405 | 0.493 |
| 0.399999999999916 | 0.331 | 0.411 | 0.5 |
| 0.404999999999916 | 0.335 | 0.416 | 0.506 |
| 0.409999999999916 | 0.34 | 0.422 | 0.513 |
| 0.414999999999916 | 0.344 | 0.427 | 0.52 |
| 0.419999999999916 | 0.348 | 0.432 | 0.526 |
| 0.424999999999916 | 0.353 | 0.438 | 0.533 |
| 0.429999999999916 | 0.357 | 0.443 | 0.54 |
| 0.434999999999916 | 0.361 | 0.449 | 0.547 |
| 0.439999999999916 | 0.366 | 0.454 | 0.553 |
| 0.444999999999916 | 0.37 | 0.46 | 0.56 |
| 0.449999999999916 | 0.375 | 0.465 | 0.567 |
| 0.454999999999916 | 0.379 | 0.471 | 0.574 |
| 0.459999999999916 | 0.383 | 0.476 | 0.581 |
| 0.464999999999916 | 0.388 | 0.482 | 0.588 |
| 0.469999999999916 | 0.392 | 0.487 | 0.594 |
| 0.474999999999916 | 0.397 | 0.493 | 0.601 |
| 0.479999999999916 | 0.401 | 0.499 | 0.608 |
| 0.484999999999916 | 0.405 | 0.504 | 0.615 |
| 0.489999999999916 | 0.41 | 0.51 | 0.622 |
| 0.494999999999916 | 0.414 | 0.515 | 0.629 |
| 0.499999999999916 | 0.419 | 0.521 | 0.636 |
| 0.504999999999916 | 0.423 | 0.527 | 0.643 |
| 0.509999999999916 | 0.428 | 0.532 | 0.65 |
| 0.514999999999916 | 0.432 | 0.538 | 0.657 |
| 0.519999999999916 | 0.437 | 0.544 | 0.664 |
| 0.524999999999916 | 0.441 | 0.549 | 0.671 |
| 0.529999999999916 | 0.446 | 0.555 | 0.678 |
| 0.534999999999916 | 0.45 | 0.561 | 0.685 |
| 0.539999999999916 | 0.455 | 0.567 | 0.693 |
| 0.544999999999916 | 0.459 | 0.572 | 0.7 |
| 0.549999999999916 | 0.464 | 0.578 | 0.707 |
| 0.554999999999916 | 0.468 | 0.584 | 0.714 |
| 0.559999999999916 | 0.473 | 0.59 | 0.721 |
| 0.564999999999916 | 0.478 | 0.596 | 0.729 |
| 0.569999999999916 | 0.482 | 0.601 | 0.736 |
| 0.574999999999916 | 0.487 | 0.607 | 0.743 |
| 0.579999999999916 | 0.491 | 0.613 | 0.75 |
| 0.584999999999916 | 0.496 | 0.619 | 0.758 |
| 0.589999999999916 | 0.501 | 0.625 | 0.765 |
| 0.594999999999916 | 0.505 | 0.631 | 0.772 |
| 0.599999999999916 | 0.51 | 0.637 | 0.78 |
| 0.604999999999916 | 0.515 | 0.643 | 0.787 |
| 0.609999999999916 | 0.519 | 0.649 | 0.795 |
| 0.614999999999916 | 0.524 | 0.655 | 0.802 |
| 0.619999999999916 | 0.529 | 0.66 | 0.81 |
| 0.624999999999916 | 0.533 | 0.666 | 0.817 |
| 0.629999999999916 | 0.538 | 0.673 | 0.825 |
| 0.634999999999916 | 0.543 | 0.679 | 0.832 |
| 0.639999999999916 | 0.548 | 0.685 | 0.84 |
| 0.644999999999916 | 0.552 | 0.691 | 0.848 |
| 0.649999999999916 | 0.557 | 0.697 | 0.855 |
| 0.654999999999916 | 0.562 | 0.703 | 0.863 |
| 0.659999999999916 | 0.567 | 0.709 | 0.871 |
| 0.664999999999916 | 0.571 | 0.715 | 0.878 |
| 0.669999999999916 | 0.576 | 0.721 | 0.886 |
| 0.674999999999916 | 0.581 | 0.727 | 0.894 |
| 0.679999999999916 | 0.586 | 0.734 | 0.902 |
| 0.684999999999916 | 0.591 | 0.74 | 0.91 |
| 0.689999999999916 | 0.596 | 0.746 | 0.917 |
| 0.694999999999916 | 0.6 | 0.752 | 0.925 |
| 0.699999999999916 | 0.605 | 0.759 | 0.933 |
| 0.704999999999916 | 0.61 | 0.765 | 0.941 |
| 0.709999999999916 | 0.615 | 0.771 | 0.949 |
| 0.714999999999916 | 0.62 | 0.777 | 0.957 |
| 0.719999999999916 | 0.625 | 0.784 | 0.965 |
| 0.724999999999916 | 0.63 | 0.79 | 0.973 |
| 0.729999999999916 | 0.635 | 0.797 | 0.981 |
| 0.734999999999916 | 0.64 | 0.803 | 0.989 |
| 0.739999999999916 | 0.645 | 0.809 | 0.998 |
| 0.744999999999916 | 0.65 | 0.816 | 1.006 |
| 0.749999999999916 | 0.655 | 0.822 | 1.014 |
| 0.754999999999916 | 0.66 | 0.829 | 1.022 |
| 0.759999999999916 | 0.665 | 0.835 | 1.031 |
| 0.764999999999916 | 0.67 | 0.842 | 1.039 |
| 0.769999999999916 | 0.675 | 0.848 | 1.047 |
| 0.774999999999916 | 0.68 | 0.855 | 1.056 |
| 0.779999999999916 | 0.685 | 0.862 | 1.064 |
| 0.784999999999916 | 0.69 | 0.868 | 1.072 |
| 0.789999999999916 | 0.695 | 0.875 | 1.081 |
| 0.794999999999916 | 0.7 | 0.881 | 1.089 |
| 0.799999999999916 | 0.705 | 0.888 | 1.098 |
| 0.804999999999916 | 0.711 | 0.895 | 1.106 |
| 0.809999999999916 | 0.716 | 0.902 | 1.115 |
| 0.814999999999916 | 0.721 | 0.908 | 1.124 |
| 0.819999999999916 | 0.726 | 0.915 | 1.132 |
| 0.824999999999916 | 0.731 | 0.922 | 1.141 |
| 0.829999999999916 | 0.737 | 0.929 | 1.15 |
| 0.834999999999916 | 0.742 | 0.935 | 1.159 |
| 0.839999999999916 | 0.747 | 0.942 | 1.167 |
| 0.844999999999916 | 0.752 | 0.949 | 1.176 |
| 0.849999999999916 | 0.758 | 0.956 | 1.185 |
| 0.854999999999916 | 0.763 | 0.963 | 1.194 |
| 0.859999999999916 | 0.768 | 0.97 | 1.203 |
| 0.864999999999916 | 0.774 | 0.977 | 1.212 |
| 0.869999999999916 | 0.779 | 0.984 | 1.221 |
| 0.874999999999916 | 0.784 | 0.991 | 1.23 |
| 0.879999999999916 | 0.79 | 0.998 | 1.239 |
| 0.884999999999916 | 0.795 | 1.005 | 1.248 |
| 0.889999999999916 | 0.8 | 1.012 | 1.257 |
| 0.894999999999916 | 0.806 | 1.019 | 1.267 |
| 0.899999999999916 | 0.811 | 1.027 | 1.276 |
| 0.904999999999916 | 0.817 | 1.034 | 1.285 |
| 0.909999999999916 | 0.822 | 1.041 | 1.294 |
| 0.914999999999916 | 0.828 | 1.048 | 1.304 |
| 0.919999999999916 | 0.833 | 1.055 | 1.313 |
| 0.924999999999916 | 0.839 | 1.063 | 1.323 |
| 0.929999999999916 | 0.844 | 1.07 | 1.332 |
| 0.934999999999916 | 0.85 | 1.077 | 1.342 |
| 0.939999999999916 | 0.856 | 1.085 | 1.351 |
| 0.944999999999916 | 0.861 | 1.092 | 1.361 |
| 0.949999999999916 | 0.867 | 1.099 | 1.37 |
| 0.954999999999916 | 0.872 | 1.107 | 1.38 |
| 0.959999999999916 | 0.878 | 1.114 | 1.39 |
| 0.964999999999916 | 0.884 | 1.122 | 1.4 |
| 0.969999999999916 | 0.889 | 1.129 | 1.409 |
| 0.974999999999916 | 0.895 | 1.137 | 1.419 |
| 0.979999999999916 | 0.901 | 1.145 | 1.429 |
| 0.984999999999916 | 0.907 | 1.152 | 1.439 |
| 0.989999999999916 | 0.912 | 1.16 | 1.449 |
| 0.994999999999916 | 0.918 | 1.168 | 1.459 |
| 0.999999999999916 | 0.924 | 1.175 | 1.469 |
| 1.004999999999916 | 0.93 | 1.183 | 1.479 |
| 1.009999999999916 | 0.936 | 1.191 | 1.489 |
| 1.014999999999916 | 0.941 | 1.198 | 1.5 |
| 1.019999999999916 | 0.947 | 1.206 | 1.51 |
| 1.024999999999916 | 0.953 | 1.214 | 1.52 |
| 1.029999999999916 | 0.959 | 1.222 | 1.531 |
| 1.034999999999916 | 0.965 | 1.23 | 1.541 |
| 1.039999999999915 | 0.971 | 1.238 | 1.551 |
| 1.044999999999915 | 0.977 | 1.246 | 1.562 |
| 1.049999999999915 | 0.983 | 1.254 | 1.572 |
| 1.054999999999915 | 0.989 | 1.262 | 1.583 |
| 1.059999999999915 | 0.995 | 1.27 | 1.594 |
| 1.064999999999915 | 1.001 | 1.278 | 1.604 |
| 1.069999999999915 | 1.007 | 1.286 | 1.615 |
| 1.074999999999915 | 1.013 | 1.294 | 1.626 |
| 1.079999999999915 | 1.019 | 1.303 | 1.637 |
| 1.084999999999914 | 1.025 | 1.311 | 1.647 |
| 1.089999999999914 | 1.031 | 1.319 | 1.658 |
| 1.094999999999914 | 1.038 | 1.327 | 1.669 |
| 1.099999999999914 | 1.044 | 1.336 | 1.68 |
| 1.104999999999914 | 1.05 | 1.344 | 1.691 |
| 1.109999999999914 | 1.056 | 1.352 | 1.703 |
| 1.114999999999914 | 1.063 | 1.361 | 1.714 |
| 1.119999999999914 | 1.069 | 1.369 | 1.725 |
| 1.124999999999914 | 1.075 | 1.378 | 1.736 |
| 1.129999999999914 | 1.081 | 1.386 | 1.748 |
| 1.134999999999913 | 1.088 | 1.395 | 1.759 |
| 1.139999999999913 | 1.094 | 1.403 | 1.77 |
| 1.144999999999913 | 1.101 | 1.412 | 1.782 |
| 1.149999999999913 | 1.107 | 1.421 | 1.793 |
| 1.154999999999913 | 1.113 | 1.429 | 1.805 |
| 1.159999999999913 | 1.12 | 1.438 | 1.817 |
| 1.164999999999913 | 1.126 | 1.447 | 1.828 |
| 1.169999999999913 | 1.133 | 1.456 | 1.84 |
| 1.174999999999913 | 1.139 | 1.465 | 1.852 |
| 1.179999999999912 | 1.146 | 1.474 | 1.864 |
| 1.184999999999912 | 1.152 | 1.482 | 1.876 |
| 1.189999999999912 | 1.159 | 1.491 | 1.888 |
| 1.194999999999912 | 1.166 | 1.5 | 1.9 |
| 1.199999999999912 | 1.172 | 1.509 | 1.912 |
| 1.204999999999912 | 1.179 | 1.519 | 1.924 |
| 1.209999999999912 | 1.186 | 1.528 | 1.936 |
| 1.214999999999912 | 1.192 | 1.537 | 1.949 |
| 1.219999999999912 | 1.199 | 1.546 | 1.961 |
| 1.224999999999911 | 1.206 | 1.555 | 1.973 |
| 1.229999999999911 | 1.213 | 1.564 | 1.986 |
| 1.234999999999911 | 1.219 | 1.574 | 1.998 |
| 1.239999999999911 | 1.226 | 1.583 | 2.011 |
| 1.244999999999911 | 1.233 | 1.592 | 2.024 |
| 1.249999999999911 | 1.24 | 1.602 | 2.036 |
| 1.254999999999911 | 1.247 | 1.611 | 2.049 |
| 1.259999999999911 | 1.254 | 1.621 | 2.062 |
| 1.264999999999911 | 1.261 | 1.63 | 2.075 |
| 1.269999999999911 | 1.268 | 1.64 | 2.088 |
| 1.27499999999991 | 1.275 | 1.65 | 2.101 |
| 1.27999999999991 | 1.282 | 1.659 | 2.114 |
| 1.28499999999991 | 1.289 | 1.669 | 2.127 |
| 1.28999999999991 | 1.296 | 1.679 | 2.14 |
| 1.29499999999991 | 1.303 | 1.689 | 2.153 |
| 1.29999999999991 | 1.31 | 1.698 | 2.167 |
| 1.30499999999991 | 1.317 | 1.708 | 2.18 |
| 1.30999999999991 | 1.325 | 1.718 | 2.194 |
| 1.31499999999991 | 1.332 | 1.728 | 2.207 |
| 1.319999999999909 | 1.339 | 1.738 | 2.221 |
| 1.324999999999909 | 1.346 | 1.748 | 2.234 |
| 1.329999999999909 | 1.354 | 1.758 | 2.248 |
| 1.334999999999909 | 1.361 | 1.768 | 2.262 |
| 1.339999999999909 | 1.368 | 1.779 | 2.276 |
| 1.344999999999909 | 1.376 | 1.789 | 2.29 |
| 1.349999999999909 | 1.383 | 1.799 | 2.304 |
| 1.354999999999909 | 1.391 | 1.809 | 2.318 |
| 1.359999999999909 | 1.398 | 1.82 | 2.332 |
| 1.364999999999908 | 1.406 | 1.83 | 2.346 |
| 1.369999999999908 | 1.413 | 1.841 | 2.36 |
| 1.374999999999908 | 1.421 | 1.851 | 2.375 |
| 1.379999999999908 | 1.428 | 1.862 | 2.389 |
| 1.384999999999908 | 1.436 | 1.872 | 2.404 |
| 1.389999999999908 | 1.443 | 1.883 | 2.418 |
| 1.394999999999908 | 1.451 | 1.894 | 2.433 |
| 1.399999999999908 | 1.459 | 1.904 | 2.448 |
| 1.404999999999908 | 1.467 | 1.915 | 2.462 |
| 1.409999999999908 | 1.474 | 1.926 | 2.477 |
| 1.414999999999907 | 1.482 | 1.937 | 2.492 |
| 1.419999999999907 | 1.49 | 1.948 | 2.507 |
| 1.424999999999907 | 1.498 | 1.959 | 2.522 |
| 1.429999999999907 | 1.506 | 1.97 | 2.538 |
| 1.434999999999907 | 1.514 | 1.981 | 2.553 |
| 1.439999999999907 | 1.521 | 1.992 | 2.568 |
| 1.444999999999907 | 1.529 | 2.003 | 2.583 |
| 1.449999999999907 | 1.537 | 2.014 | 2.599 |
| 1.454999999999907 | 1.545 | 2.026 | 2.615 |
| 1.459999999999906 | 1.554 | 2.037 | 2.63 |
| 1.464999999999906 | 1.562 | 2.048 | 2.646 |
| 1.469999999999906 | 1.57 | 2.06 | 2.662 |
| 1.474999999999906 | 1.578 | 2.071 | 2.678 |
| 1.479999999999906 | 1.586 | 2.083 | 2.694 |
| 1.484999999999906 | 1.594 | 2.094 | 2.71 |
| 1.489999999999906 | 1.603 | 2.106 | 2.726 |
| 1.494999999999906 | 1.611 | 2.118 | 2.742 |
| 1.499999999999906 | 1.619 | 2.129 | 2.758 |
| 1.504999999999906 | 1.628 | 2.141 | 2.775 |
| 1.509999999999905 | 1.636 | 2.153 | 2.791 |
| 1.514999999999905 | 1.644 | 2.165 | 2.808 |
| 1.519999999999905 | 1.653 | 2.177 | 2.824 |
| 1.524999999999905 | 1.661 | 2.189 | 2.841 |
| 1.529999999999905 | 1.67 | 2.201 | 2.858 |
| 1.534999999999905 | 1.678 | 2.213 | 2.875 |
| 1.539999999999905 | 1.687 | 2.225 | 2.892 |
| 1.544999999999905 | 1.696 | 2.237 | 2.909 |
| 1.549999999999905 | 1.704 | 2.25 | 2.926 |
| 1.554999999999904 | 1.713 | 2.262 | 2.943 |
| 1.559999999999904 | 1.722 | 2.274 | 2.96 |
| 1.564999999999904 | 1.73 | 2.287 | 2.978 |
| 1.569999999999904 | 1.739 | 2.299 | 2.995 |
| 1.574999999999904 | 1.748 | 2.312 | 3.013 |
| 1.579999999999904 | 1.757 | 2.324 | 3.031 |
| 1.584999999999904 | 1.766 | 2.337 | 3.048 |
| 1.589999999999904 | 1.775 | 2.35 | 3.066 |
| 1.594999999999904 | 1.784 | 2.363 | 3.084 |
| 1.599999999999903 | 1.793 | 2.376 | 3.102 |
| 1.604999999999903 | 1.802 | 2.388 | 3.12 |
| 1.609999999999903 | 1.811 | 2.401 | 3.139 |
| 1.614999999999903 | 1.82 | 2.414 | 3.157 |
| 1.619999999999903 | 1.829 | 2.428 | 3.175 |
| 1.624999999999903 | 1.838 | 2.441 | 3.194 |
| 1.629999999999903 | 1.848 | 2.454 | 3.213 |
| 1.634999999999903 | 1.857 | 2.467 | 3.231 |
| 1.639999999999903 | 1.866 | 2.481 | 3.25 |
| 1.644999999999902 | 1.875 | 2.494 | 3.269 |
| 1.649999999999902 | 1.885 | 2.507 | 3.288 |
| 1.654999999999902 | 1.894 | 2.521 | 3.307 |
| 1.659999999999902 | 1.904 | 2.535 | 3.326 |
| 1.664999999999902 | 1.913 | 2.548 | 3.346 |
| 1.669999999999902 | 1.923 | 2.562 | 3.365 |
| 1.674999999999902 | 1.932 | 2.576 | 3.385 |
| 1.679999999999902 | 1.942 | 2.59 | 3.404 |
| 1.684999999999902 | 1.952 | 2.604 | 3.424 |
| 1.689999999999901 | 1.961 | 2.617 | 3.444 |
| 1.694999999999901 | 1.971 | 2.632 | 3.464 |
| 1.699999999999901 | 1.981 | 2.646 | 3.484 |
| 1.704999999999901 | 1.991 | 2.66 | 3.504 |
| 1.709999999999901 | 2 | 2.674 | 3.524 |
| 1.714999999999901 | 2.01 | 2.688 | 3.545 |
| 1.719999999999901 | 2.02 | 2.703 | 3.565 |
| 1.724999999999901 | 2.03 | 2.717 | 3.586 |
| 1.729999999999901 | 2.04 | 2.732 | 3.606 |
| 1.734999999999901 | 2.05 | 2.746 | 3.627 |
| 1.7399999999999 | 2.06 | 2.761 | 3.648 |
| 1.7449999999999 | 2.07 | 2.776 | 3.669 |
| 1.7499999999999 | 2.081 | 2.79 | 3.69 |
| 1.7549999999999 | 2.091 | 2.805 | 3.711 |
| 1.7599999999999 | 2.101 | 2.82 | 3.733 |
| 1.7649999999999 | 2.111 | 2.835 | 3.754 |
| 1.7699999999999 | 2.122 | 2.85 | 3.776 |
| 1.7749999999999 | 2.132 | 2.865 | 3.797 |
| 1.7799999999999 | 2.143 | 2.881 | 3.819 |
| 1.784999999999899 | 2.153 | 2.896 | 3.841 |
| 1.789999999999899 | 2.164 | 2.911 | 3.863 |
| 1.794999999999899 | 2.174 | 2.927 | 3.885 |
| 1.799999999999899 | 2.185 | 2.942 | 3.908 |
| 1.804999999999899 | 2.195 | 2.958 | 3.93 |
| 1.809999999999899 | 2.206 | 2.973 | 3.952 |
| 1.814999999999899 | 2.217 | 2.989 | 3.975 |
| 1.819999999999899 | 2.228 | 3.005 | 3.998 |
| 1.824999999999899 | 2.239 | 3.021 | 4.021 |
| 1.829999999999899 | 2.249 | 3.037 | 4.044 |
| 1.834999999999898 | 2.26 | 3.053 | 4.067 |
| 1.839999999999898 | 2.271 | 3.069 | 4.09 |
| 1.844999999999898 | 2.282 | 3.085 | 4.113 |
| 1.849999999999898 | 2.293 | 3.101 | 4.137 |
| 1.854999999999898 | 2.305 | 3.118 | 4.16 |
| 1.859999999999898 | 2.316 | 3.134 | 4.184 |
| 1.864999999999898 | 2.327 | 3.151 | 4.208 |
| 1.869999999999898 | 2.338 | 3.167 | 4.232 |
| 1.874999999999898 | 2.349 | 3.184 | 4.256 |
| 1.879999999999897 | 2.361 | 3.2 | 4.28 |
| 1.884999999999897 | 2.372 | 3.217 | 4.305 |
| 1.889999999999897 | 2.384 | 3.234 | 4.329 |
| 1.894999999999897 | 2.395 | 3.251 | 4.354 |
| 1.899999999999897 | 2.407 | 3.268 | 4.379 |
| 1.904999999999897 | 2.418 | 3.285 | 4.404 |
| 1.909999999999897 | 2.43 | 3.303 | 4.429 |
| 1.914999999999897 | 2.442 | 3.32 | 4.454 |
| 1.919999999999897 | 2.453 | 3.337 | 4.479 |
| 1.924999999999897 | 2.465 | 3.355 | 4.505 |
| 1.929999999999896 | 2.477 | 3.372 | 4.53 |
| 1.934999999999896 | 2.489 | 3.39 | 4.556 |
| 1.939999999999896 | 2.501 | 3.408 | 4.582 |
| 1.944999999999896 | 2.513 | 3.425 | 4.608 |
| 1.949999999999896 | 2.525 | 3.443 | 4.634 |
| 1.954999999999896 | 2.537 | 3.461 | 4.66 |
| 1.959999999999896 | 2.549 | 3.479 | 4.686 |
| 1.964999999999896 | 2.561 | 3.497 | 4.713 |
| 1.969999999999896 | 2.573 | 3.516 | 4.74 |
| 1.974999999999895 | 2.586 | 3.534 | 4.766 |
| 1.979999999999895 | 2.598 | 3.552 | 4.793 |
| 1.984999999999895 | 2.61 | 3.571 | 4.821 |
| 1.989999999999895 | 2.623 | 3.589 | 4.848 |
| 1.994999999999895 | 2.635 | 3.608 | 4.875 |
| 1.999999999999895 | 2.648 | 3.627 | 4.903 |
| 2.004999999999895 | 2.661 | 3.646 | 4.931 |
| 2.009999999999895 | 2.673 | 3.665 | 4.958 |
| 2.014999999999895 | 2.686 | 3.684 | 4.986 |
| 2.019999999999895 | 2.699 | 3.703 | 5.015 |
| 2.024999999999895 | 2.712 | 3.722 | 5.043 |
| 2.029999999999895 | 2.724 | 3.741 | 5.071 |
| 2.034999999999894 | 2.737 | 3.761 | 5.1 |
| 2.039999999999894 | 2.75 | 3.78 | 5.129 |
| 2.044999999999894 | 2.763 | 3.8 | 5.158 |
| 2.049999999999894 | 2.777 | 3.82 | 5.187 |
| 2.054999999999894 | 2.79 | 3.839 | 5.216 |
| 2.059999999999894 | 2.803 | 3.859 | 5.245 |
| 2.064999999999894 | 2.816 | 3.879 | 5.275 |
| 2.069999999999894 | 2.83 | 3.899 | 5.305 |
| 2.074999999999894 | 2.843 | 3.919 | 5.335 |
| 2.079999999999893 | 2.856 | 3.94 | 5.365 |
| 2.084999999999893 | 2.87 | 3.96 | 5.395 |
| 2.089999999999893 | 2.883 | 3.981 | 5.425 |
| 2.094999999999893 | 2.897 | 4.001 | 5.456 |
| 2.099999999999893 | 2.911 | 4.022 | 5.486 |
| 2.104999999999893 | 2.924 | 4.043 | 5.517 |
| 2.109999999999893 | 2.938 | 4.064 | 5.548 |
| 2.114999999999893 | 2.952 | 4.084 | 5.579 |
| 2.119999999999893 | 2.966 | 4.106 | 5.611 |
| 2.124999999999893 | 2.98 | 4.127 | 5.642 |
| 2.129999999999892 | 2.994 | 4.148 | 5.674 |
| 2.134999999999892 | 3.008 | 4.169 | 5.706 |
| 2.139999999999892 | 3.022 | 4.191 | 5.738 |
| 2.144999999999892 | 3.037 | 4.212 | 5.77 |
| 2.149999999999892 | 3.051 | 4.234 | 5.803 |
| 2.154999999999892 | 3.065 | 4.256 | 5.835 |
| 2.159999999999892 | 3.08 | 4.278 | 5.868 |
| 2.164999999999892 | 3.094 | 4.3 | 5.901 |
| 2.169999999999892 | 3.109 | 4.322 | 5.934 |
| 2.174999999999891 | 3.123 | 4.344 | 5.967 |
| 2.179999999999891 | 3.138 | 4.367 | 6.001 |
| 2.184999999999891 | 3.153 | 4.389 | 6.034 |
| 2.189999999999891 | 3.167 | 4.412 | 6.068 |
| 2.194999999999891 | 3.182 | 4.434 | 6.102 |
| 2.199999999999891 | 3.197 | 4.457 | 6.136 |
| 2.204999999999891 | 3.212 | 4.48 | 6.171 |
| 2.209999999999891 | 3.227 | 4.503 | 6.205 |
| 2.214999999999891 | 3.242 | 4.526 | 6.24 |
| 2.21999999999989 | 3.257 | 4.549 | 6.275 |
| 2.22499999999989 | 3.273 | 4.573 | 6.31 |
| 2.22999999999989 | 3.288 | 4.596 | 6.345 |
| 2.23499999999989 | 3.303 | 4.62 | 6.381 |
| 2.23999999999989 | 3.319 | 4.643 | 6.417 |
| 2.24499999999989 | 3.334 | 4.667 | 6.453 |
| 2.24999999999989 | 3.35 | 4.691 | 6.489 |
| 2.25499999999989 | 3.365 | 4.715 | 6.525 |
| 2.25999999999989 | 3.381 | 4.739 | 6.561 |
| 2.26499999999989 | 3.397 | 4.764 | 6.598 |
| 2.269999999999889 | 3.413 | 4.788 | 6.635 |
| 2.274999999999889 | 3.429 | 4.813 | 6.672 |
| 2.279999999999889 | 3.445 | 4.837 | 6.709 |
| 2.284999999999889 | 3.461 | 4.862 | 6.747 |
| 2.289999999999889 | 3.477 | 4.887 | 6.785 |
| 2.294999999999889 | 3.493 | 4.912 | 6.823 |
| 2.299999999999889 | 3.509 | 4.937 | 6.861 |
| 2.304999999999889 | 3.526 | 4.962 | 6.899 |
| 2.309999999999889 | 3.542 | 4.988 | 6.937 |
| 2.314999999999888 | 3.559 | 5.013 | 6.976 |
| 2.319999999999888 | 3.575 | 5.039 | 7.015 |
| 2.324999999999888 | 3.592 | 5.064 | 7.054 |
| 2.329999999999888 | 3.608 | 5.09 | 7.094 |
| 2.334999999999888 | 3.625 | 5.116 | 7.133 |
| 2.339999999999888 | 3.642 | 5.142 | 7.173 |
| 2.344999999999888 | 3.659 | 5.169 | 7.213 |
| 2.349999999999888 | 3.676 | 5.195 | 7.253 |
| 2.354999999999888 | 3.693 | 5.222 | 7.294 |
| 2.359999999999887 | 3.71 | 5.248 | 7.334 |
| 2.364999999999887 | 3.727 | 5.275 | 7.375 |
| 2.369999999999887 | 3.745 | 5.302 | 7.417 |
| 2.374999999999887 | 3.762 | 5.329 | 7.458 |
| 2.379999999999887 | 3.78 | 5.356 | 7.499 |
| 2.384999999999887 | 3.797 | 5.383 | 7.541 |
| 2.389999999999887 | 3.815 | 5.411 | 7.583 |
| 2.394999999999887 | 3.832 | 5.439 | 7.626 |
| 2.399999999999887 | 3.85 | 5.466 | 7.668 |
| 2.404999999999887 | 3.868 | 5.494 | 7.711 |
| 2.409999999999886 | 3.886 | 5.522 | 7.754 |
| 2.414999999999886 | 3.904 | 5.55 | 7.797 |
| 2.419999999999886 | 3.922 | 5.578 | 7.84 |
| 2.424999999999886 | 3.94 | 5.607 | 7.884 |
| 2.429999999999886 | 3.958 | 5.635 | 7.928 |
| 2.434999999999886 | 3.977 | 5.664 | 7.972 |
| 2.439999999999886 | 3.995 | 5.693 | 8.016 |
| 2.444999999999886 | 4.013 | 5.722 | 8.061 |
| 2.449999999999886 | 4.032 | 5.751 | 8.106 |
| 2.454999999999885 | 4.051 | 5.78 | 8.151 |
| 2.459999999999885 | 4.069 | 5.81 | 8.196 |
| 2.464999999999885 | 4.088 | 5.839 | 8.242 |
| 2.469999999999885 | 4.107 | 5.869 | 8.288 |
| 2.474999999999885 | 4.126 | 5.899 | 8.334 |
| 2.479999999999885 | 4.145 | 5.929 | 8.38 |
| 2.484999999999885 | 4.164 | 5.959 | 8.427 |
| 2.489999999999885 | 4.183 | 5.989 | 8.474 |
| 2.494999999999885 | 4.203 | 6.02 | 8.521 |
| 2.499999999999884 | 4.222 | 6.05 | 8.568 |
| 2.504999999999884 | 4.242 | 6.081 | 8.616 |
| 2.509999999999884 | 4.261 | 6.112 | 8.664 |
| 2.514999999999884 | 4.281 | 6.143 | 8.712 |
| 2.519999999999884 | 4.3 | 6.174 | 8.76 |
| 2.524999999999884 | 4.32 | 6.205 | 8.809 |
| 2.529999999999884 | 4.34 | 6.237 | 8.858 |
| 2.534999999999884 | 4.36 | 6.269 | 8.907 |
| 2.539999999999884 | 4.38 | 6.3 | 8.957 |
| 2.544999999999884 | 4.4 | 6.332 | 9.007 |
| 2.549999999999883 | 4.421 | 6.365 | 9.057 |
| 2.554999999999883 | 4.441 | 6.397 | 9.107 |
| 2.559999999999883 | 4.461 | 6.429 | 9.158 |
| 2.564999999999883 | 4.482 | 6.462 | 9.208 |
| 2.569999999999883 | 4.503 | 6.495 | 9.26 |
| 2.574999999999883 | 4.523 | 6.528 | 9.311 |
| 2.579999999999883 | 4.544 | 6.561 | 9.363 |
| 2.584999999999883 | 4.565 | 6.594 | 9.415 |
| 2.589999999999883 | 4.586 | 6.627 | 9.467 |
| 2.594999999999882 | 4.607 | 6.661 | 9.519 |
| 2.599999999999882 | 4.628 | 6.695 | 9.572 |
| 2.604999999999882 | 4.649 | 6.729 | 9.625 |
| 2.609999999999882 | 4.671 | 6.763 | 9.679 |
| 2.614999999999882 | 4.692 | 6.797 | 9.733 |
| 2.619999999999882 | 4.714 | 6.831 | 9.787 |
| 2.624999999999882 | 4.735 | 6.866 | 9.841 |
| 2.629999999999882 | 4.757 | 6.901 | 9.896 |
| 2.634999999999882 | 4.779 | 6.936 | 9.95 |
| 2.639999999999881 | 4.801 | 6.971 | 10.006 |
| 2.644999999999881 | 4.823 | 7.006 | 10.061 |
| 2.649999999999881 | 4.845 | 7.042 | 10.117 |
| 2.654999999999881 | 4.867 | 7.077 | 10.173 |
| 2.659999999999881 | 4.89 | 7.113 | 10.23 |
| 2.664999999999881 | 4.912 | 7.149 | 10.286 |
| 2.669999999999881 | 4.935 | 7.185 | 10.343 |
| 2.674999999999881 | 4.957 | 7.222 | 10.401 |
| 2.679999999999881 | 4.98 | 7.258 | 10.458 |
| 2.68499999999988 | 5.003 | 7.295 | 10.516 |
| 2.68999999999988 | 5.026 | 7.332 | 10.575 |
| 2.69499999999988 | 5.049 | 7.369 | 10.633 |
| 2.69999999999988 | 5.072 | 7.406 | 10.692 |
| 2.70499999999988 | 5.095 | 7.444 | 10.752 |
| 2.70999999999988 | 5.118 | 7.481 | 10.811 |
| 2.71499999999988 | 5.142 | 7.519 | 10.871 |
| 2.71999999999988 | 5.165 | 7.557 | 10.931 |
| 2.72499999999988 | 5.189 | 7.595 | 10.992 |
| 2.72999999999988 | 5.213 | 7.634 | 11.053 |
| 2.734999999999879 | 5.237 | 7.672 | 11.114 |
| 2.739999999999879 | 5.261 | 7.711 | 11.176 |
| 2.744999999999879 | 5.285 | 7.75 | 11.238 |
| 2.749999999999879 | 5.309 | 7.789 | 11.3 |
| 2.754999999999879 | 5.333 | 7.829 | 11.363 |
| 2.759999999999879 | 5.358 | 7.868 | 11.426 |
| 2.764999999999879 | 5.382 | 7.908 | 11.489 |
| 2.769999999999879 | 5.407 | 7.948 | 11.553 |
| 2.774999999999879 | 5.431 | 7.988 | 11.617 |
| 2.779999999999878 | 5.456 | 8.028 | 11.681 |
| 2.784999999999878 | 5.481 | 8.069 | 11.746 |
| 2.789999999999878 | 5.506 | 8.11 | 11.811 |
| 2.794999999999878 | 5.531 | 8.151 | 11.876 |
| 2.799999999999878 | 5.557 | 8.192 | 11.942 |
| 2.804999999999878 | 5.582 | 8.233 | 12.008 |
| 2.809999999999878 | 5.608 | 8.275 | 12.074 |
| 2.814999999999878 | 5.633 | 8.317 | 12.141 |
| 2.819999999999878 | 5.659 | 8.359 | 12.209 |
| 2.824999999999878 | 5.685 | 8.401 | 12.276 |
| 2.829999999999877 | 5.711 | 8.443 | 12.344 |
| 2.834999999999877 | 5.737 | 8.486 | 12.413 |
| 2.839999999999877 | 5.763 | 8.529 | 12.481 |
| 2.844999999999877 | 5.789 | 8.572 | 12.55 |
| 2.849999999999877 | 5.816 | 8.615 | 12.62 |
| 2.854999999999877 | 5.842 | 8.658 | 12.69 |
| 2.859999999999877 | 5.869 | 8.702 | 12.76 |
| 2.864999999999877 | 5.896 | 8.746 | 12.831 |
| 2.869999999999877 | 5.923 | 8.79 | 12.902 |
| 2.874999999999876 | 5.95 | 8.835 | 12.973 |
| 2.879999999999876 | 5.977 | 8.879 | 13.045 |
| 2.884999999999876 | 6.004 | 8.924 | 13.117 |
| 2.889999999999876 | 6.031 | 8.969 | 13.19 |
| 2.894999999999876 | 6.059 | 9.014 | 13.263 |
| 2.899999999999876 | 6.086 | 9.06 | 13.336 |
| 2.904999999999876 | 6.114 | 9.105 | 13.41 |
| 2.909999999999876 | 6.142 | 9.151 | 13.484 |
| 2.914999999999876 | 6.17 | 9.197 | 13.559 |
| 2.919999999999876 | 6.198 | 9.244 | 13.634 |
| 2.924999999999875 | 6.226 | 9.29 | 13.709 |
| 2.929999999999875 | 6.255 | 9.337 | 13.785 |
| 2.934999999999875 | 6.283 | 9.384 | 13.861 |
| 2.939999999999875 | 6.312 | 9.431 | 13.938 |
| 2.944999999999875 | 6.341 | 9.479 | 14.015 |
| 2.949999999999875 | 6.37 | 9.527 | 14.093 |
| 2.954999999999875 | 6.399 | 9.575 | 14.17 |
| 2.959999999999875 | 6.428 | 9.623 | 14.249 |
| 2.964999999999875 | 6.457 | 9.672 | 14.328 |
| 2.969999999999874 | 6.486 | 9.72 | 14.407 |
| 2.974999999999874 | 6.516 | 9.769 | 14.487 |
| 2.979999999999874 | 6.546 | 9.819 | 14.567 |
| 2.984999999999874 | 6.575 | 9.868 | 14.647 |
| 2.989999999999874 | 6.605 | 9.918 | 14.728 |
| 2.994999999999874 | 6.635 | 9.968 | 14.81 |
| 2.999999999999874 | 6.666 | 10.018 | 14.892 |
| 3.004999999999874 | 6.696 | 10.068 | 14.974 |
| 3.009999999999874 | 6.726 | 10.119 | 15.057 |
| 3.014999999999874 | 6.757 | 10.17 | 15.14 |
| 3.019999999999873 | 6.788 | 10.221 | 15.224 |
| 3.024999999999873 | 6.819 | 10.273 | 15.308 |
| 3.029999999999873 | 6.85 | 10.324 | 15.393 |
| 3.034999999999873 | 6.881 | 10.376 | 15.478 |
| 3.039999999999873 | 6.912 | 10.429 | 15.563 |
| 3.044999999999873 | 6.944 | 10.481 | 15.649 |
| 3.049999999999873 | 6.975 | 10.534 | 15.736 |
| 3.054999999999873 | 7.007 | 10.587 | 15.823 |
| 3.059999999999873 | 7.039 | 10.64 | 15.91 |
| 3.064999999999872 | 7.071 | 10.694 | 15.998 |
| 3.069999999999872 | 7.103 | 10.748 | 16.087 |
| 3.074999999999872 | 7.135 | 10.802 | 16.176 |
| 3.079999999999872 | 7.168 | 10.856 | 16.265 |
| 3.084999999999872 | 7.2 | 10.911 | 16.355 |
| 3.089999999999872 | 7.233 | 10.966 | 16.445 |
| 3.094999999999872 | 7.266 | 11.021 | 16.536 |
| 3.099999999999872 | 7.299 | 11.076 | 16.628 |
| 3.104999999999872 | 7.332 | 11.132 | 16.72 |
| 3.109999999999872 | 7.365 | 11.188 | 16.812 |
| 3.114999999999871 | 7.399 | 11.245 | 16.905 |
| 3.119999999999871 | 7.432 | 11.301 | 16.998 |
| 3.124999999999871 | 7.466 | 11.358 | 17.092 |
| 3.129999999999871 | 7.5 | 11.415 | 17.187 |
| 3.134999999999871 | 7.534 | 11.473 | 17.282 |
| 3.139999999999871 | 7.568 | 11.53 | 17.377 |
| 3.144999999999871 | 7.603 | 11.588 | 17.473 |
| 3.149999999999871 | 7.637 | 11.647 | 17.57 |
| 3.154999999999871 | 7.672 | 11.705 | 17.667 |
| 3.15999999999987 | 7.707 | 11.764 | 17.765 |
| 3.16499999999987 | 7.742 | 11.823 | 17.863 |
| 3.16999999999987 | 7.777 | 11.883 | 17.961 |
| 3.17499999999987 | 7.812 | 11.943 | 18.061 |
| 3.17999999999987 | 7.848 | 12.003 | 18.16 |
| 3.18499999999987 | 7.883 | 12.063 | 18.261 |
| 3.18999999999987 | 7.919 | 12.124 | 18.362 |
| 3.19499999999987 | 7.955 | 12.185 | 18.463 |
| 3.19999999999987 | 7.991 | 12.246 | 18.565 |
| 3.204999999999869 | 8.027 | 12.307 | 18.668 |
| 3.209999999999869 | 8.064 | 12.369 | 18.771 |
| 3.214999999999869 | 8.1 | 12.432 | 18.875 |
| 3.219999999999869 | 8.137 | 12.494 | 18.979 |
| 3.224999999999869 | 8.174 | 12.557 | 19.084 |
| 3.229999999999869 | 8.211 | 12.62 | 19.189 |
| 3.234999999999869 | 8.248 | 12.684 | 19.295 |
| 3.239999999999869 | 8.286 | 12.747 | 19.402 |
| 3.244999999999869 | 8.323 | 12.811 | 19.509 |
| 3.249999999999869 | 8.361 | 12.876 | 19.617 |
| 3.254999999999868 | 8.399 | 12.941 | 19.725 |
| 3.259999999999868 | 8.437 | 13.006 | 19.834 |
| 3.264999999999868 | 8.476 | 13.071 | 19.944 |
| 3.269999999999868 | 8.514 | 13.137 | 20.054 |
| 3.274999999999868 | 8.553 | 13.203 | 20.164 |
| 3.279999999999868 | 8.591 | 13.269 | 20.276 |
| 3.284999999999868 | 8.63 | 13.336 | 20.388 |
| 3.289999999999868 | 8.669 | 13.403 | 20.5 |
| 3.294999999999868 | 8.709 | 13.47 | 20.614 |
| 3.299999999999867 | 8.748 | 13.538 | 20.727 |
| 3.304999999999867 | 8.788 | 13.606 | 20.842 |
| 3.309999999999867 | 8.828 | 13.674 | 20.957 |
| 3.314999999999867 | 8.868 | 13.743 | 21.073 |
| 3.319999999999867 | 8.908 | 13.812 | 21.189 |
| 3.324999999999867 | 8.948 | 13.882 | 21.306 |
| 3.329999999999867 | 8.989 | 13.951 | 21.424 |
| 3.334999999999867 | 9.03 | 14.021 | 21.542 |
| 3.339999999999867 | 9.071 | 14.092 | 21.661 |
| 3.344999999999866 | 9.112 | 14.163 | 21.781 |
| 3.349999999999866 | 9.153 | 14.234 | 21.901 |
| 3.354999999999866 | 9.195 | 14.305 | 22.022 |
| 3.359999999999866 | 9.236 | 14.377 | 22.144 |
| 3.364999999999866 | 9.278 | 14.449 | 22.266 |
| 3.369999999999866 | 9.32 | 14.522 | 22.389 |
| 3.374999999999866 | 9.362 | 14.595 | 22.512 |
| 3.379999999999866 | 9.405 | 14.668 | 22.637 |
| 3.384999999999866 | 9.447 | 14.742 | 22.762 |
| 3.389999999999866 | 9.49 | 14.816 | 22.887 |
| 3.394999999999865 | 9.533 | 14.891 | 23.014 |
| 3.399999999999865 | 9.576 | 14.965 | 23.141 |
| 3.404999999999865 | 9.62 | 15.041 | 23.269 |
| 3.409999999999865 | 9.663 | 15.116 | 23.397 |
| 3.414999999999865 | 9.707 | 15.192 | 23.526 |
| 3.419999999999865 | 9.751 | 15.268 | 23.656 |
| 3.424999999999865 | 9.795 | 15.345 | 23.787 |
| 3.429999999999865 | 9.84 | 15.422 | 23.918 |
| 3.434999999999865 | 9.884 | 15.5 | 24.05 |
| 3.439999999999864 | 9.929 | 15.577 | 24.183 |
| 3.444999999999864 | 9.974 | 15.656 | 24.316 |
| 3.449999999999864 | 10.019 | 15.734 | 24.451 |
| 3.454999999999864 | 10.064 | 15.813 | 24.586 |
| 3.459999999999864 | 10.11 | 15.893 | 24.721 |
| 3.464999999999864 | 10.156 | 15.973 | 24.858 |
| 3.469999999999864 | 10.202 | 16.053 | 24.995 |
| 3.474999999999864 | 10.248 | 16.133 | 25.133 |
| 3.479999999999864 | 10.294 | 16.214 | 25.272 |
| 3.484999999999864 | 10.341 | 16.296 | 25.411 |
| 3.489999999999863 | 10.388 | 16.378 | 25.552 |
| 3.494999999999863 | 10.435 | 16.46 | 25.693 |
| 3.499999999999863 | 10.482 | 16.543 | 25.834 |
| 3.504999999999863 | 10.529 | 16.626 | 25.977 |
| 3.509999999999863 | 10.577 | 16.709 | 26.12 |
| 3.514999999999863 | 10.625 | 16.793 | 26.265 |
| 3.519999999999863 | 10.673 | 16.877 | 26.41 |
| 3.524999999999863 | 10.721 | 16.962 | 26.555 |
| 3.529999999999863 | 10.77 | 17.047 | 26.702 |
| 3.534999999999862 | 10.819 | 17.133 | 26.849 |
| 3.539999999999862 | 10.868 | 17.219 | 26.998 |
| 3.544999999999862 | 10.917 | 17.305 | 27.147 |
| 3.549999999999862 | 10.966 | 17.392 | 27.296 |
| 3.554999999999862 | 11.016 | 17.48 | 27.447 |
| 3.559999999999862 | 11.066 | 17.567 | 27.599 |
| 3.564999999999862 | 11.116 | 17.656 | 27.751 |
| 3.569999999999862 | 11.166 | 17.744 | 27.904 |
| 3.574999999999862 | 11.217 | 17.833 | 28.058 |
| 3.579999999999862 | 11.267 | 17.923 | 28.213 |
| 3.584999999999861 | 11.318 | 18.013 | 28.369 |
| 3.589999999999861 | 11.369 | 18.103 | 28.525 |
| 3.594999999999861 | 11.421 | 18.194 | 28.683 |
| 3.599999999999861 | 11.473 | 18.285 | 28.841 |
| 3.604999999999861 | 11.524 | 18.377 | 29 |
| 3.609999999999861 | 11.577 | 18.47 | 29.16 |
| 3.614999999999861 | 11.629 | 18.562 | 29.321 |
| 3.619999999999861 | 11.682 | 18.655 | 29.483 |
| 3.62499999999986 | 11.734 | 18.749 | 29.646 |
| 3.62999999999986 | 11.787 | 18.843 | 29.809 |
| 3.63499999999986 | 11.841 | 18.938 | 29.974 |
| 3.63999999999986 | 11.894 | 19.033 | 30.139 |
| 3.64499999999986 | 11.948 | 19.128 | 30.306 |
| 3.64999999999986 | 12.002 | 19.224 | 30.473 |
| 3.65499999999986 | 12.056 | 19.321 | 30.641 |
| 3.65999999999986 | 12.111 | 19.418 | 30.81 |
| 3.66499999999986 | 12.166 | 19.515 | 30.98 |
| 3.669999999999859 | 12.221 | 19.613 | 31.151 |
| 3.674999999999859 | 12.276 | 19.712 | 31.323 |
| 3.679999999999859 | 12.332 | 19.811 | 31.496 |
| 3.684999999999859 | 12.387 | 19.91 | 31.67 |
| 3.689999999999859 | 12.443 | 20.01 | 31.845 |
| 3.694999999999859 | 12.5 | 20.11 | 32.02 |
| 3.699999999999859 | 12.556 | 20.211 | 32.197 |
| 3.704999999999859 | 12.613 | 20.313 | 32.375 |
| 3.709999999999859 | 12.67 | 20.415 | 32.553 |
| 3.714999999999859 | 12.727 | 20.517 | 32.733 |
| 3.719999999999858 | 12.785 | 20.62 | 32.914 |
| 3.724999999999858 | 12.843 | 20.724 | 33.095 |
| 3.729999999999858 | 12.901 | 20.828 | 33.278 |
| 3.734999999999858 | 12.959 | 20.932 | 33.461 |
| 3.739999999999858 | 13.018 | 21.037 | 33.646 |
| 3.744999999999858 | 13.076 | 21.143 | 33.832 |
| 3.749999999999858 | 13.136 | 21.249 | 34.018 |
| 3.754999999999858 | 13.195 | 21.355 | 34.206 |
| 3.759999999999858 | 13.255 | 21.463 | 34.395 |
| 3.764999999999857 | 13.314 | 21.57 | 34.585 |
| 3.769999999999857 | 13.375 | 21.679 | 34.775 |
| 3.774999999999857 | 13.435 | 21.787 | 34.967 |
| 3.779999999999857 | 13.496 | 21.897 | 35.16 |
| 3.784999999999857 | 13.557 | 22.006 | 35.354 |
| 3.789999999999857 | 13.618 | 22.117 | 35.549 |
| 3.794999999999857 | 13.68 | 22.228 | 35.746 |
| 3.799999999999857 | 13.742 | 22.339 | 35.943 |
| 3.804999999999857 | 13.804 | 22.451 | 36.141 |
| 3.809999999999857 | 13.866 | 22.564 | 36.341 |
| 3.814999999999856 | 13.929 | 22.677 | 36.541 |
| 3.819999999999856 | 13.992 | 22.791 | 36.743 |
| 3.824999999999856 | 14.055 | 22.905 | 36.945 |
| 3.829999999999856 | 14.118 | 23.02 | 37.149 |
| 3.834999999999856 | 14.182 | 23.136 | 37.354 |
| 3.839999999999856 | 14.246 | 23.252 | 37.56 |
| 3.844999999999856 | 14.311 | 23.369 | 37.768 |
| 3.849999999999856 | 14.375 | 23.486 | 37.976 |
| 3.854999999999856 | 14.44 | 23.604 | 38.185 |
| 3.859999999999855 | 14.506 | 23.722 | 38.396 |
| 3.864999999999855 | 14.571 | 23.841 | 38.608 |
| 3.869999999999855 | 14.637 | 23.961 | 38.821 |
| 3.874999999999855 | 14.703 | 24.081 | 39.035 |
| 3.879999999999855 | 14.77 | 24.202 | 39.251 |
| 3.884999999999855 | 14.836 | 24.323 | 39.467 |
| 3.889999999999855 | 14.903 | 24.445 | 39.685 |
| 3.894999999999855 | 14.971 | 24.568 | 39.904 |
| 3.899999999999855 | 15.038 | 24.691 | 40.124 |
| 3.904999999999855 | 15.106 | 24.815 | 40.345 |
| 3.909999999999854 | 15.174 | 24.939 | 40.568 |
| 3.914999999999854 | 15.243 | 25.065 | 40.792 |
| 3.919999999999854 | 15.312 | 25.19 | 41.017 |
| 3.924999999999854 | 15.381 | 25.317 | 41.243 |
| 3.929999999999854 | 15.451 | 25.444 | 41.471 |
| 3.934999999999854 | 15.52 | 25.571 | 41.699 |
| 3.939999999999854 | 15.59 | 25.7 | 41.93 |
| 3.944999999999854 | 15.661 | 25.828 | 42.161 |
| 3.949999999999854 | 15.732 | 25.958 | 42.393 |
| 3.954999999999853 | 15.803 | 26.088 | 42.627 |
| 3.959999999999853 | 15.874 | 26.219 | 42.863 |
| 3.964999999999853 | 15.946 | 26.351 | 43.099 |
| 3.969999999999853 | 16.018 | 26.483 | 43.337 |
| 3.974999999999853 | 16.09 | 26.616 | 43.576 |
| 3.979999999999853 | 16.163 | 26.749 | 43.816 |
| 3.984999999999853 | 16.236 | 26.883 | 44.058 |
| 3.989999999999853 | 16.309 | 27.018 | 44.301 |
| 3.994999999999853 | 16.383 | 27.154 | 44.545 |
| 3.999999999999853 | 16.457 | 27.29 | 44.791 |
| 4.004999999999852 | 16.531 | 27.427 | 45.038 |
| 4.009999999999852 | 16.606 | 27.564 | 45.287 |
| 4.014999999999852 | 16.681 | 27.703 | 45.537 |
| 4.019999999999852 | 16.756 | 27.842 | 45.788 |
| 4.024999999999852 | 16.832 | 27.981 | 46.04 |
| 4.029999999999852 | 16.908 | 28.122 | 46.294 |
| 4.034999999999852 | 16.984 | 28.263 | 46.55 |
| 4.039999999999851 | 17.061 | 28.404 | 46.807 |
| 4.044999999999852 | 17.138 | 28.547 | 47.065 |
| 4.049999999999851 | 17.215 | 28.69 | 47.324 |
| 4.054999999999851 | 17.293 | 28.834 | 47.586 |
| 4.059999999999851 | 17.371 | 28.979 | 47.848 |
| 4.064999999999851 | 17.45 | 29.124 | 48.112 |
| 4.069999999999851 | 17.529 | 29.27 | 48.377 |
| 4.074999999999851 | 17.608 | 29.417 | 48.644 |
| 4.07999999999985 | 17.687 | 29.564 | 48.913 |
| 4.084999999999851 | 17.767 | 29.713 | 49.183 |
| 4.08999999999985 | 17.847 | 29.862 | 49.454 |
| 4.094999999999851 | 17.928 | 30.011 | 49.727 |
| 4.09999999999985 | 18.009 | 30.162 | 50.001 |
| 4.10499999999985 | 18.09 | 30.313 | 50.277 |
| 4.10999999999985 | 18.172 | 30.465 | 50.554 |
| 4.11499999999985 | 18.254 | 30.618 | 50.833 |
| 4.11999999999985 | 18.336 | 30.771 | 51.113 |
| 4.12499999999985 | 18.419 | 30.926 | 51.395 |
| 4.12999999999985 | 18.502 | 31.081 | 51.679 |
| 4.13499999999985 | 18.586 | 31.237 | 51.964 |
| 4.13999999999985 | 18.67 | 31.393 | 52.251 |
| 4.144999999999849 | 18.754 | 31.551 | 52.539 |
| 4.14999999999985 | 18.839 | 31.709 | 52.829 |
| 4.154999999999849 | 18.924 | 31.868 | 53.12 |
| 4.15999999999985 | 19.009 | 32.028 | 53.413 |
| 4.164999999999849 | 19.095 | 32.189 | 53.708 |
| 4.169999999999849 | 19.181 | 32.35 | 54.004 |
| 4.174999999999849 | 19.268 | 32.512 | 54.302 |
| 4.179999999999848 | 19.355 | 32.675 | 54.602 |
| 4.184999999999849 | 19.442 | 32.839 | 54.903 |
| 4.189999999999848 | 19.53 | 33.004 | 55.206 |
| 4.194999999999848 | 19.618 | 33.169 | 55.51 |
| 4.199999999999848 | 19.707 | 33.336 | 55.816 |
| 4.204999999999848 | 19.796 | 33.503 | 56.124 |
| 4.209999999999848 | 19.885 | 33.671 | 56.434 |
| 4.214999999999848 | 19.975 | 33.84 | 56.745 |
| 4.219999999999847 | 20.065 | 34.009 | 57.058 |
| 4.224999999999848 | 20.156 | 34.18 | 57.373 |
| 4.229999999999847 | 20.247 | 34.351 | 57.689 |
| 4.234999999999847 | 20.338 | 34.524 | 58.008 |
| 4.239999999999847 | 20.43 | 34.697 | 58.328 |
| 4.244999999999847 | 20.522 | 34.871 | 58.649 |
| 4.249999999999847 | 20.615 | 35.046 | 58.973 |
| 4.254999999999847 | 20.708 | 35.221 | 59.298 |
| 4.259999999999846 | 20.801 | 35.398 | 59.625 |
| 4.264999999999847 | 20.895 | 35.575 | 59.954 |
| 4.269999999999846 | 20.99 | 35.754 | 60.285 |
| 4.274999999999846 | 21.084 | 35.933 | 60.617 |
| 4.279999999999846 | 21.18 | 36.113 | 60.952 |
| 4.284999999999846 | 21.275 | 36.294 | 61.288 |
| 4.289999999999846 | 21.371 | 36.476 | 61.626 |
| 4.294999999999846 | 21.468 | 36.659 | 61.966 |
| 4.299999999999846 | 21.565 | 36.843 | 62.308 |
| 4.304999999999846 | 21.662 | 37.028 | 62.651 |
| 4.309999999999845 | 21.76 | 37.214 | 62.997 |
| 4.314999999999846 | 21.858 | 37.4 | 63.344 |
| 4.319999999999845 | 21.957 | 37.588 | 63.694 |
| 4.324999999999846 | 22.056 | 37.776 | 64.045 |
| 4.329999999999845 | 22.155 | 37.966 | 64.398 |
| 4.334999999999845 | 22.255 | 38.156 | 64.754 |
| 4.339999999999845 | 22.356 | 38.347 | 65.111 |
| 4.344999999999845 | 22.457 | 38.54 | 65.47 |
| 4.349999999999845 | 22.558 | 38.733 | 65.831 |
| 4.354999999999845 | 22.66 | 38.927 | 66.194 |
| 4.359999999999844 | 22.762 | 39.122 | 66.559 |
| 4.364999999999845 | 22.865 | 39.318 | 66.927 |
| 4.369999999999844 | 22.968 | 39.515 | 67.296 |
| 4.374999999999844 | 23.072 | 39.714 | 67.667 |
| 4.379999999999844 | 23.176 | 39.913 | 68.04 |
| 4.384999999999844 | 23.281 | 40.113 | 68.415 |
| 4.389999999999844 | 23.386 | 40.314 | 68.793 |
| 4.394999999999844 | 23.491 | 40.516 | 69.172 |
| 4.399999999999844 | 23.597 | 40.719 | 69.554 |
| 4.404999999999844 | 23.704 | 40.923 | 69.937 |
| 4.409999999999843 | 23.811 | 41.129 | 70.323 |
| 4.414999999999844 | 23.918 | 41.335 | 70.711 |
| 4.419999999999843 | 24.026 | 41.542 | 71.101 |
| 4.424999999999843 | 24.135 | 41.75 | 71.493 |
| 4.429999999999843 | 24.243 | 41.96 | 71.888 |
| 4.434999999999843 | 24.353 | 42.17 | 72.284 |
| 4.439999999999843 | 24.463 | 42.382 | 72.683 |
| 4.444999999999843 | 24.573 | 42.594 | 73.084 |
| 4.449999999999842 | 24.684 | 42.808 | 73.487 |
| 4.454999999999843 | 24.796 | 43.022 | 73.892 |
| 4.459999999999842 | 24.907 | 43.238 | 74.3 |
| 4.464999999999843 | 25.02 | 43.455 | 74.71 |
| 4.469999999999842 | 25.133 | 43.673 | 75.122 |
| 4.474999999999842 | 25.246 | 43.892 | 75.536 |
| 4.479999999999842 | 25.36 | 44.112 | 75.953 |
| 4.484999999999842 | 25.475 | 44.333 | 76.372 |
| 4.489999999999842 | 25.59 | 44.555 | 76.793 |
| 4.494999999999842 | 25.705 | 44.779 | 77.216 |
| 4.499999999999841 | 25.821 | 45.003 | 77.642 |
| 4.504999999999842 | 25.938 | 45.229 | 78.071 |
| 4.509999999999841 | 26.055 | 45.455 | 78.501 |
| 4.514999999999842 | 26.172 | 45.683 | 78.934 |
| 4.519999999999841 | 26.29 | 45.912 | 79.37 |
| 4.524999999999841 | 26.409 | 46.143 | 79.807 |
| 4.529999999999841 | 26.528 | 46.374 | 80.248 |
| 4.534999999999841 | 26.648 | 46.606 | 80.69 |
| 4.53999999999984 | 26.768 | 46.84 | 81.135 |
| 4.544999999999841 | 26.889 | 47.075 | 81.583 |
| 4.54999999999984 | 27.01 | 47.311 | 82.033 |
| 4.554999999999841 | 27.132 | 47.548 | 82.485 |
| 4.55999999999984 | 27.255 | 47.787 | 82.94 |
| 4.564999999999841 | 27.378 | 48.026 | 83.398 |
| 4.56999999999984 | 27.501 | 48.267 | 83.858 |
| 4.57499999999984 | 27.625 | 48.509 | 84.32 |
| 4.57999999999984 | 27.75 | 48.752 | 84.785 |
| 4.58499999999984 | 27.875 | 48.996 | 85.253 |
| 4.58999999999984 | 28.001 | 49.242 | 85.723 |
| 4.59499999999984 | 28.127 | 49.489 | 86.196 |
| 4.59999999999984 | 28.254 | 49.737 | 86.671 |
| 4.60499999999984 | 28.382 | 49.986 | 87.149 |
| 4.60999999999984 | 28.51 | 50.237 | 87.63 |
| 4.614999999999839 | 28.638 | 50.489 | 88.113 |
| 4.61999999999984 | 28.768 | 50.742 | 88.599 |
| 4.624999999999839 | 28.897 | 50.996 | 89.088 |
| 4.62999999999984 | 29.028 | 51.252 | 89.579 |
| 4.634999999999839 | 29.159 | 51.509 | 90.073 |
| 4.639999999999838 | 29.29 | 51.767 | 90.57 |
| 4.644999999999839 | 29.422 | 52.027 | 91.07 |
| 4.649999999999838 | 29.555 | 52.288 | 91.572 |
| 4.654999999999839 | 29.689 | 52.55 | 92.077 |
| 4.659999999999838 | 29.823 | 52.813 | 92.585 |
| 4.664999999999838 | 29.957 | 53.078 | 93.096 |
| 4.669999999999838 | 30.092 | 53.344 | 93.609 |
| 4.674999999999838 | 30.228 | 53.612 | 94.125 |
| 4.679999999999837 | 30.364 | 53.88 | 94.645 |
| 4.684999999999838 | 30.501 | 54.151 | 95.167 |
| 4.689999999999837 | 30.639 | 54.422 | 95.692 |
| 4.694999999999838 | 30.777 | 54.695 | 96.219 |
| 4.699999999999837 | 30.916 | 54.969 | 96.75 |
| 4.704999999999837 | 31.056 | 55.245 | 97.284 |
| 4.709999999999837 | 31.196 | 55.522 | 97.82 |
| 4.714999999999837 | 31.337 | 55.8 | 98.36 |
| 4.719999999999837 | 31.478 | 56.08 | 98.902 |
| 4.724999999999837 | 31.62 | 56.361 | 99.448 |
| 4.729999999999836 | 31.763 | 56.643 | 99.996 |
| 4.734999999999836 | 31.906 | 56.927 | 100.548 |
| 4.739999999999836 | 32.05 | 57.213 | 101.102 |
| 4.744999999999836 | 32.195 | 57.5 | 101.66 |
| 4.749999999999836 | 32.34 | 57.788 | 102.221 |
| 4.754999999999836 | 32.486 | 58.078 | 102.784 |
| 4.759999999999836 | 32.632 | 58.369 | 103.351 |
| 4.764999999999836 | 32.78 | 58.661 | 103.921 |
| 4.769999999999836 | 32.927 | 58.955 | 104.495 |
| 4.774999999999835 | 33.076 | 59.251 | 105.071 |
| 4.779999999999835 | 33.225 | 59.548 | 105.65 |
| 4.784999999999835 | 33.375 | 59.847 | 106.233 |
| 4.789999999999835 | 33.526 | 60.147 | 106.819 |
| 4.794999999999835 | 33.677 | 60.448 | 107.408 |
| 4.799999999999835 | 33.829 | 60.751 | 108.001 |
| 4.804999999999835 | 33.982 | 61.056 | 108.596 |
| 4.809999999999835 | 34.135 | 61.362 | 109.195 |
| 4.814999999999835 | 34.289 | 61.669 | 109.798 |
| 4.819999999999835 | 34.444 | 61.979 | 110.403 |
| 4.824999999999835 | 34.599 | 62.289 | 111.012 |
| 4.829999999999834 | 34.755 | 62.601 | 111.624 |
| 4.834999999999834 | 34.912 | 62.915 | 112.24 |
| 4.839999999999834 | 35.069 | 63.231 | 112.859 |
| 4.844999999999834 | 35.228 | 63.548 | 113.481 |
| 4.849999999999834 | 35.387 | 63.866 | 114.107 |
| 4.854999999999834 | 35.546 | 64.186 | 114.737 |
| 4.859999999999834 | 35.707 | 64.508 | 115.37 |
| 4.864999999999834 | 35.868 | 64.832 | 116.006 |
| 4.869999999999834 | 36.029 | 65.157 | 116.646 |
| 4.874999999999834 | 36.192 | 65.483 | 117.289 |
| 4.879999999999833 | 36.355 | 65.812 | 117.936 |
| 4.884999999999834 | 36.519 | 66.141 | 118.586 |
| 4.889999999999833 | 36.684 | 66.473 | 119.24 |
| 4.894999999999833 | 36.85 | 66.806 | 119.898 |
| 4.899999999999833 | 37.016 | 67.141 | 120.559 |
| 4.904999999999833 | 37.183 | 67.478 | 121.224 |
| 4.909999999999833 | 37.351 | 67.816 | 121.893 |
| 4.914999999999833 | 37.519 | 68.156 | 122.565 |
| 4.919999999999832 | 37.688 | 68.498 | 123.241 |
| 4.924999999999833 | 37.858 | 68.841 | 123.921 |
| 4.929999999999832 | 38.029 | 69.186 | 124.604 |
| 4.934999999999832 | 38.201 | 69.533 | 125.292 |
| 4.939999999999832 | 38.373 | 69.882 | 125.983 |
| 4.944999999999832 | 38.546 | 70.232 | 126.677 |
| 4.949999999999832 | 38.72 | 70.584 | 127.376 |
| 4.954999999999832 | 38.895 | 70.938 | 128.079 |
| 4.959999999999832 | 39.07 | 71.293 | 128.785 |
| 4.964999999999832 | 39.246 | 71.651 | 129.495 |
| 4.969999999999831 | 39.423 | 72.01 | 130.21 |
| 4.974999999999831 | 39.601 | 72.371 | 130.928 |
| 4.97999999999983 | 39.78 | 72.734 | 131.65 |
| 4.984999999999831 | 39.959 | 73.098 | 132.376 |
| 4.98999999999983 | 40.14 | 73.465 | 133.106 |
| 4.994999999999831 | 40.321 | 73.833 | 133.84 |
| 4.99999999999983 | 40.503 | 74.203 | 134.578 |